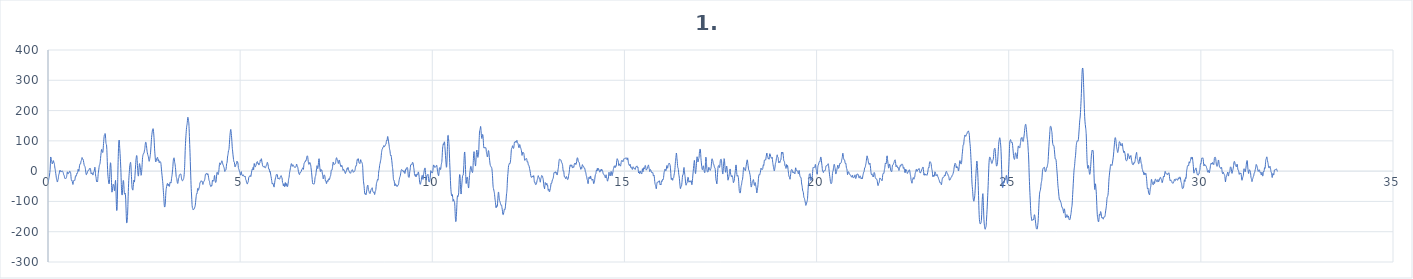
| Category | 1. kanál |
|---|---|
| 0.0 | -30.1 |
| 0.0078125 | -34.2 |
| 0.015625 | -29.4 |
| 0.0234375 | -22.9 |
| 0.03125 | -19.9 |
| 0.0390625 | -12.9 |
| 0.046875 | -4.4 |
| 0.0546875 | 4.5 |
| 0.0625 | 26 |
| 0.0703125 | 46.8 |
| 0.078125 | 43.8 |
| 0.0859375 | 34.8 |
| 0.09375 | 35.4 |
| 0.1015625 | 30.7 |
| 0.109375 | 24 |
| 0.1171875 | 25.7 |
| 0.125 | 28.2 |
| 0.1328125 | 31.4 |
| 0.140625 | 34.7 |
| 0.1484375 | 31 |
| 0.15625 | 27.1 |
| 0.1640625 | 25.2 |
| 0.171875 | 17.9 |
| 0.1796875 | 10.5 |
| 0.1875 | 5.8 |
| 0.1953125 | -1.5 |
| 0.203125 | -8.7 |
| 0.2109375 | -15.7 |
| 0.21875 | -23.9 |
| 0.2265625 | -28.2 |
| 0.234375 | -31.4 |
| 0.2421875 | -35.9 |
| 0.25 | -34 |
| 0.2578125 | -29.1 |
| 0.265625 | -25.5 |
| 0.2734375 | -17.5 |
| 0.28125 | -11.3 |
| 0.2890625 | -9.8 |
| 0.296875 | -3.2 |
| 0.3046875 | 2.1 |
| 0.3125 | -0.7 |
| 0.3203125 | -0.9 |
| 0.328125 | 2 |
| 0.3359375 | 0 |
| 0.34375 | -2.1 |
| 0.3515625 | -1.1 |
| 0.359375 | -0.9 |
| 0.3671875 | 0 |
| 0.375 | 0.8 |
| 0.3828125 | -1.6 |
| 0.390625 | -3.5 |
| 0.3984375 | -5.6 |
| 0.40625 | -11 |
| 0.4140625 | -13.5 |
| 0.421875 | -14.4 |
| 0.4296875 | -20 |
| 0.4375 | -23.9 |
| 0.4453125 | -23.2 |
| 0.453125 | -23.8 |
| 0.4609375 | -24.8 |
| 0.46875 | -23.8 |
| 0.4765625 | -21.7 |
| 0.484375 | -18 |
| 0.4921875 | -11.2 |
| 0.5 | -3.8 |
| 0.5078125 | -2.5 |
| 0.515625 | -7.4 |
| 0.5234375 | -9.6 |
| 0.53125 | -6.9 |
| 0.5390625 | -5.1 |
| 0.546875 | -5.8 |
| 0.5546875 | -4.1 |
| 0.5625 | -0.3 |
| 0.5703125 | -0.2 |
| 0.578125 | -2.8 |
| 0.5859375 | -4.4 |
| 0.59375 | -10.8 |
| 0.6015625 | -23.3 |
| 0.609375 | -30.4 |
| 0.6171875 | -29.8 |
| 0.625 | -30.4 |
| 0.6328125 | -34.8 |
| 0.640625 | -40.5 |
| 0.6484375 | -44.1 |
| 0.65625 | -41 |
| 0.6640625 | -34.5 |
| 0.671875 | -30.8 |
| 0.6796875 | -29.3 |
| 0.6875 | -29.5 |
| 0.6953125 | -30.6 |
| 0.703125 | -26.8 |
| 0.7109375 | -19.2 |
| 0.71875 | -15.2 |
| 0.7265625 | -15.6 |
| 0.734375 | -16.6 |
| 0.7421875 | -13.4 |
| 0.75 | -7.4 |
| 0.7578125 | -6 |
| 0.765625 | -7 |
| 0.7734375 | -1.7 |
| 0.78125 | 5.6 |
| 0.7890625 | 5.5 |
| 0.796875 | 0.3 |
| 0.8046875 | 0.4 |
| 0.8125 | 8.8 |
| 0.8203125 | 17.8 |
| 0.828125 | 22.7 |
| 0.8359375 | 24 |
| 0.84375 | 23.2 |
| 0.8515625 | 26.4 |
| 0.859375 | 32.9 |
| 0.8671875 | 35 |
| 0.875 | 37.9 |
| 0.8828125 | 44.4 |
| 0.890625 | 44.3 |
| 0.8984375 | 39.8 |
| 0.90625 | 39.5 |
| 0.9140625 | 39.3 |
| 0.921875 | 34.8 |
| 0.9296875 | 28.6 |
| 0.9375 | 22.7 |
| 0.9453125 | 18.4 |
| 0.953125 | 16.5 |
| 0.9609375 | 15.5 |
| 0.96875 | 11.3 |
| 0.9765625 | 4.5 |
| 0.984375 | -3.1 |
| 0.9921875 | -10.6 |
| 1.0 | -11.7 |
| 1.0078125 | -7.8 |
| 1.015625 | -7.6 |
| 1.0234375 | -6.7 |
| 1.03125 | -1.2 |
| 1.0390625 | 1.5 |
| 1.046875 | 2.1 |
| 1.0546875 | 3.6 |
| 1.0625 | 2.7 |
| 1.0703125 | 3.5 |
| 1.078125 | 8.4 |
| 1.0859375 | 10.1 |
| 1.09375 | 8.7 |
| 1.1015625 | 8.7 |
| 1.109375 | 4.6 |
| 1.1171875 | -4.8 |
| 1.125 | -9.4 |
| 1.1328125 | -7.3 |
| 1.140625 | -5.5 |
| 1.1484375 | -5.7 |
| 1.15625 | -8 |
| 1.1640625 | -12.3 |
| 1.171875 | -12.5 |
| 1.1796875 | -6.9 |
| 1.1875 | -2.9 |
| 1.1953125 | -2.1 |
| 1.203125 | 0.7 |
| 1.2109375 | 7.2 |
| 1.21875 | 13.1 |
| 1.2265625 | 8.6 |
| 1.234375 | -6.9 |
| 1.2421875 | -16.7 |
| 1.25 | -20 |
| 1.2578125 | -28.8 |
| 1.265625 | -34.5 |
| 1.2734375 | -32.4 |
| 1.28125 | -34.3 |
| 1.2890625 | -34.9 |
| 1.296875 | -24.6 |
| 1.3046875 | -11.8 |
| 1.3125 | -3.2 |
| 1.3203125 | 4.2 |
| 1.328125 | 12.3 |
| 1.3359375 | 18.7 |
| 1.34375 | 21.5 |
| 1.3515625 | 24.2 |
| 1.359375 | 31.3 |
| 1.3671875 | 42.1 |
| 1.375 | 52.1 |
| 1.3828125 | 61.2 |
| 1.390625 | 69.9 |
| 1.3984375 | 71.6 |
| 1.40625 | 66.8 |
| 1.4140625 | 63.8 |
| 1.421875 | 61.3 |
| 1.4296875 | 63.6 |
| 1.4375 | 76.8 |
| 1.4453125 | 91.3 |
| 1.453125 | 103.2 |
| 1.4609375 | 114.8 |
| 1.46875 | 119.4 |
| 1.4765625 | 120.2 |
| 1.484375 | 124.2 |
| 1.4921875 | 122.2 |
| 1.5 | 108 |
| 1.5078125 | 93.4 |
| 1.515625 | 89.2 |
| 1.5234375 | 86.7 |
| 1.53125 | 71.6 |
| 1.5390625 | 45.5 |
| 1.546875 | 17.4 |
| 1.5546875 | -5.3 |
| 1.5625 | -18.6 |
| 1.5703125 | -27.5 |
| 1.578125 | -36.2 |
| 1.5859375 | -42 |
| 1.59375 | -41.4 |
| 1.6015625 | -28.6 |
| 1.609375 | -4.7 |
| 1.6171875 | 17.2 |
| 1.625 | 27.8 |
| 1.6328125 | 25.4 |
| 1.640625 | 9.3 |
| 1.6484375 | -20.3 |
| 1.65625 | -53.1 |
| 1.6640625 | -69.4 |
| 1.671875 | -66.4 |
| 1.6796875 | -58.5 |
| 1.6875 | -50.1 |
| 1.6953125 | -43.6 |
| 1.703125 | -44.2 |
| 1.7109375 | -46.4 |
| 1.71875 | -51.6 |
| 1.7265625 | -63.2 |
| 1.734375 | -64.7 |
| 1.7421875 | -51.4 |
| 1.75 | -36.9 |
| 1.7578125 | -30.4 |
| 1.765625 | -46.6 |
| 1.7734375 | -85 |
| 1.78125 | -116.8 |
| 1.7890625 | -130.1 |
| 1.796875 | -125.4 |
| 1.8046875 | -93 |
| 1.8125 | -42.2 |
| 1.8203125 | 6.5 |
| 1.828125 | 48.1 |
| 1.8359375 | 78.9 |
| 1.84375 | 96.9 |
| 1.8515625 | 102.5 |
| 1.859375 | 92.3 |
| 1.8671875 | 74.4 |
| 1.875 | 58.3 |
| 1.8828125 | 40.7 |
| 1.890625 | 20.3 |
| 1.8984375 | -4.7 |
| 1.90625 | -36.6 |
| 1.9140625 | -63 |
| 1.921875 | -75.9 |
| 1.9296875 | -79 |
| 1.9375 | -69.1 |
| 1.9453125 | -49.1 |
| 1.953125 | -34.6 |
| 1.9609375 | -30.5 |
| 1.96875 | -35.8 |
| 1.9765625 | -51.9 |
| 1.984375 | -69 |
| 1.9921875 | -75.9 |
| 2.0 | -74.7 |
| 2.0078125 | -72.4 |
| 2.015625 | -76.7 |
| 2.0234375 | -94.9 |
| 2.03125 | -124.9 |
| 2.0390625 | -154.7 |
| 2.046875 | -170.6 |
| 2.0546875 | -170.4 |
| 2.0625 | -162.5 |
| 2.0703125 | -146.3 |
| 2.078125 | -116.8 |
| 2.0859375 | -82.8 |
| 2.09375 | -54.2 |
| 2.1015625 | -31 |
| 2.109375 | -14.6 |
| 2.1171875 | -1.3 |
| 2.125 | 13.3 |
| 2.1328125 | 22.1 |
| 2.140625 | 25.9 |
| 2.1484375 | 29.2 |
| 2.15625 | 21.7 |
| 2.1640625 | 2.8 |
| 2.171875 | -17.4 |
| 2.1796875 | -39.2 |
| 2.1875 | -55.5 |
| 2.1953125 | -59.7 |
| 2.203125 | -61.9 |
| 2.2109375 | -61.9 |
| 2.21875 | -51.2 |
| 2.2265625 | -36.6 |
| 2.234375 | -29.6 |
| 2.2421875 | -33 |
| 2.25 | -36.2 |
| 2.2578125 | -26.6 |
| 2.265625 | -9.5 |
| 2.2734375 | 5.5 |
| 2.28125 | 21.3 |
| 2.2890625 | 36.3 |
| 2.296875 | 45.3 |
| 2.3046875 | 51.3 |
| 2.3125 | 51 |
| 2.3203125 | 38.3 |
| 2.328125 | 19.1 |
| 2.3359375 | 1.5 |
| 2.34375 | -11.9 |
| 2.3515625 | -16.4 |
| 2.359375 | -10.3 |
| 2.3671875 | 3.9 |
| 2.375 | 19.3 |
| 2.3828125 | 25.1 |
| 2.390625 | 20.1 |
| 2.3984375 | 13.4 |
| 2.40625 | 6.7 |
| 2.4140625 | -3.8 |
| 2.421875 | -13.8 |
| 2.4296875 | -12.4 |
| 2.4375 | -0.5 |
| 2.4453125 | 13.1 |
| 2.453125 | 29.2 |
| 2.4609375 | 44.8 |
| 2.46875 | 51.6 |
| 2.4765625 | 55 |
| 2.484375 | 58.4 |
| 2.4921875 | 58.3 |
| 2.5 | 60.6 |
| 2.5078125 | 66.9 |
| 2.515625 | 71.6 |
| 2.5234375 | 78.7 |
| 2.53125 | 88.9 |
| 2.5390625 | 94.9 |
| 2.546875 | 95.5 |
| 2.5546875 | 92.1 |
| 2.5625 | 84.3 |
| 2.5703125 | 74.3 |
| 2.578125 | 65.8 |
| 2.5859375 | 60 |
| 2.59375 | 55.3 |
| 2.6015625 | 51.9 |
| 2.609375 | 48.9 |
| 2.6171875 | 42.9 |
| 2.625 | 35.3 |
| 2.6328125 | 32.4 |
| 2.640625 | 35.6 |
| 2.6484375 | 41.5 |
| 2.65625 | 47.5 |
| 2.6640625 | 55.1 |
| 2.671875 | 66.5 |
| 2.6796875 | 80.6 |
| 2.6875 | 96.6 |
| 2.6953125 | 111.1 |
| 2.703125 | 120.8 |
| 2.7109375 | 128.8 |
| 2.71875 | 135.5 |
| 2.7265625 | 138.9 |
| 2.734375 | 140.2 |
| 2.7421875 | 136.2 |
| 2.75 | 125.5 |
| 2.7578125 | 111.8 |
| 2.765625 | 93.6 |
| 2.7734375 | 73.6 |
| 2.78125 | 59.3 |
| 2.7890625 | 46.4 |
| 2.796875 | 34 |
| 2.8046875 | 30.4 |
| 2.8125 | 32.8 |
| 2.8203125 | 35.7 |
| 2.828125 | 39.9 |
| 2.8359375 | 42.9 |
| 2.84375 | 44.8 |
| 2.8515625 | 45.5 |
| 2.859375 | 39 |
| 2.8671875 | 33.8 |
| 2.875 | 37.7 |
| 2.8828125 | 36.6 |
| 2.890625 | 28.8 |
| 2.8984375 | 28.1 |
| 2.90625 | 31.6 |
| 2.9140625 | 31.9 |
| 2.921875 | 31.3 |
| 2.9296875 | 30.1 |
| 2.9375 | 26 |
| 2.9453125 | 16.5 |
| 2.953125 | 3.9 |
| 2.9609375 | -6 |
| 2.96875 | -15.2 |
| 2.9765625 | -25.4 |
| 2.984375 | -34.4 |
| 2.9921875 | -46.7 |
| 3.0 | -62.9 |
| 3.0078125 | -76.3 |
| 3.015625 | -90.8 |
| 3.0234375 | -108.3 |
| 3.03125 | -117.8 |
| 3.0390625 | -117.9 |
| 3.046875 | -114.5 |
| 3.0546875 | -101.6 |
| 3.0625 | -80.2 |
| 3.0703125 | -65.1 |
| 3.078125 | -57.5 |
| 3.0859375 | -50.7 |
| 3.09375 | -46.3 |
| 3.1015625 | -42.6 |
| 3.109375 | -40.3 |
| 3.1171875 | -44.5 |
| 3.125 | -48.6 |
| 3.1328125 | -45.8 |
| 3.140625 | -42.4 |
| 3.1484375 | -45.5 |
| 3.15625 | -50.5 |
| 3.1640625 | -47.5 |
| 3.171875 | -39.3 |
| 3.1796875 | -35.9 |
| 3.1875 | -36.8 |
| 3.1953125 | -39.2 |
| 3.203125 | -38.4 |
| 3.2109375 | -29.1 |
| 3.21875 | -20.1 |
| 3.2265625 | -15 |
| 3.234375 | -5.8 |
| 3.2421875 | 4.4 |
| 3.25 | 15.7 |
| 3.2578125 | 30.9 |
| 3.265625 | 39.6 |
| 3.2734375 | 42.5 |
| 3.28125 | 43.8 |
| 3.2890625 | 37 |
| 3.296875 | 28.8 |
| 3.3046875 | 24.2 |
| 3.3125 | 16.4 |
| 3.3203125 | 6.4 |
| 3.328125 | -6.1 |
| 3.3359375 | -18.2 |
| 3.34375 | -21.3 |
| 3.3515625 | -24.4 |
| 3.359375 | -33.2 |
| 3.3671875 | -38.6 |
| 3.375 | -40.8 |
| 3.3828125 | -38.1 |
| 3.390625 | -28.9 |
| 3.3984375 | -23.8 |
| 3.40625 | -21.4 |
| 3.4140625 | -15.5 |
| 3.421875 | -12.7 |
| 3.4296875 | -12.2 |
| 3.4375 | -9.7 |
| 3.4453125 | -9 |
| 3.453125 | -9.5 |
| 3.4609375 | -11.4 |
| 3.46875 | -17.9 |
| 3.4765625 | -25.3 |
| 3.484375 | -29.6 |
| 3.4921875 | -31.3 |
| 3.5 | -31.9 |
| 3.5078125 | -31.2 |
| 3.515625 | -28.6 |
| 3.5234375 | -26.1 |
| 3.53125 | -23.6 |
| 3.5390625 | -16.7 |
| 3.546875 | -5.3 |
| 3.5546875 | 11.5 |
| 3.5625 | 38.3 |
| 3.5703125 | 68.3 |
| 3.578125 | 92.1 |
| 3.5859375 | 109.6 |
| 3.59375 | 124 |
| 3.6015625 | 137.7 |
| 3.609375 | 148.3 |
| 3.6171875 | 153.3 |
| 3.625 | 161.2 |
| 3.6328125 | 173.8 |
| 3.640625 | 178.1 |
| 3.6484375 | 172.5 |
| 3.65625 | 166.8 |
| 3.6640625 | 159.6 |
| 3.671875 | 141.4 |
| 3.6796875 | 114.2 |
| 3.6875 | 88.1 |
| 3.6953125 | 62.3 |
| 3.703125 | 31.5 |
| 3.7109375 | -0.4 |
| 3.71875 | -30.7 |
| 3.7265625 | -56.7 |
| 3.734375 | -75.4 |
| 3.7421875 | -94.4 |
| 3.75 | -113.3 |
| 3.7578125 | -120.6 |
| 3.765625 | -122.2 |
| 3.7734375 | -126.6 |
| 3.78125 | -128.4 |
| 3.7890625 | -126.7 |
| 3.796875 | -125.6 |
| 3.8046875 | -124.4 |
| 3.8125 | -122 |
| 3.8203125 | -118.8 |
| 3.828125 | -115.5 |
| 3.8359375 | -108.7 |
| 3.84375 | -98.1 |
| 3.8515625 | -88.6 |
| 3.859375 | -80 |
| 3.8671875 | -74.6 |
| 3.875 | -75.2 |
| 3.8828125 | -70.6 |
| 3.890625 | -59.9 |
| 3.8984375 | -57.1 |
| 3.90625 | -61.5 |
| 3.9140625 | -63.3 |
| 3.921875 | -60.5 |
| 3.9296875 | -55.9 |
| 3.9375 | -52.7 |
| 3.9453125 | -47.6 |
| 3.953125 | -39.7 |
| 3.9609375 | -36.7 |
| 3.96875 | -36.7 |
| 3.9765625 | -33.5 |
| 3.984375 | -31.9 |
| 3.9921875 | -33.3 |
| 4.0 | -33 |
| 4.0078125 | -32.6 |
| 4.015625 | -35.2 |
| 4.0234375 | -40.8 |
| 4.03125 | -44.1 |
| 4.0390625 | -40.4 |
| 4.046875 | -35.3 |
| 4.0546875 | -34.5 |
| 4.0625 | -33.7 |
| 4.0703125 | -30.7 |
| 4.078125 | -27.7 |
| 4.0859375 | -21.5 |
| 4.09375 | -13.1 |
| 4.1015625 | -9.5 |
| 4.109375 | -9.8 |
| 4.1171875 | -9 |
| 4.125 | -7.4 |
| 4.1328125 | -8.2 |
| 4.140625 | -11.6 |
| 4.1484375 | -12 |
| 4.15625 | -8.5 |
| 4.1640625 | -9.3 |
| 4.171875 | -15.3 |
| 4.1796875 | -21.8 |
| 4.1875 | -28.3 |
| 4.1953125 | -31.9 |
| 4.203125 | -34.1 |
| 4.2109375 | -41.3 |
| 4.21875 | -46.6 |
| 4.2265625 | -46.9 |
| 4.234375 | -50.2 |
| 4.2421875 | -50.9 |
| 4.25 | -46.8 |
| 4.2578125 | -48.1 |
| 4.265625 | -47.4 |
| 4.2734375 | -36.6 |
| 4.28125 | -29.7 |
| 4.2890625 | -31.4 |
| 4.296875 | -32.2 |
| 4.3046875 | -32.2 |
| 4.3125 | -32.2 |
| 4.3203125 | -26.8 |
| 4.328125 | -17.3 |
| 4.3359375 | -14.1 |
| 4.34375 | -22.3 |
| 4.3515625 | -32.9 |
| 4.359375 | -37.1 |
| 4.3671875 | -37 |
| 4.375 | -33.2 |
| 4.3828125 | -22.9 |
| 4.390625 | -10.5 |
| 4.3984375 | -4 |
| 4.40625 | -4.3 |
| 4.4140625 | -7.7 |
| 4.421875 | -10.9 |
| 4.4296875 | -11.1 |
| 4.4375 | -7.5 |
| 4.4453125 | 0.1 |
| 4.453125 | 11.3 |
| 4.4609375 | 21.8 |
| 4.46875 | 27.4 |
| 4.4765625 | 25.9 |
| 4.484375 | 21.6 |
| 4.4921875 | 22.6 |
| 4.5 | 26 |
| 4.5078125 | 27 |
| 4.515625 | 30.5 |
| 4.5234375 | 34.2 |
| 4.53125 | 32.8 |
| 4.5390625 | 28.9 |
| 4.546875 | 24.3 |
| 4.5546875 | 21 |
| 4.5625 | 19 |
| 4.5703125 | 15.3 |
| 4.578125 | 12.7 |
| 4.5859375 | 9.4 |
| 4.59375 | 2.1 |
| 4.6015625 | -1.2 |
| 4.609375 | 1.8 |
| 4.6171875 | 4.1 |
| 4.625 | 3.8 |
| 4.6328125 | 5.6 |
| 4.640625 | 15 |
| 4.6484375 | 24.4 |
| 4.65625 | 26.6 |
| 4.6640625 | 33.9 |
| 4.671875 | 46.6 |
| 4.6796875 | 52.3 |
| 4.6875 | 58 |
| 4.6953125 | 66.5 |
| 4.703125 | 69.2 |
| 4.7109375 | 74 |
| 4.71875 | 88 |
| 4.7265625 | 103.7 |
| 4.734375 | 116.8 |
| 4.7421875 | 127.3 |
| 4.75 | 135.4 |
| 4.7578125 | 137.6 |
| 4.765625 | 129.7 |
| 4.7734375 | 117.9 |
| 4.78125 | 106 |
| 4.7890625 | 89.8 |
| 4.796875 | 75.4 |
| 4.8046875 | 66.2 |
| 4.8125 | 56 |
| 4.8203125 | 46.6 |
| 4.828125 | 38.4 |
| 4.8359375 | 31.5 |
| 4.84375 | 31.1 |
| 4.8515625 | 27.9 |
| 4.859375 | 17.6 |
| 4.8671875 | 13.8 |
| 4.875 | 15.3 |
| 4.8828125 | 17 |
| 4.890625 | 22.7 |
| 4.8984375 | 24.3 |
| 4.90625 | 24.6 |
| 4.9140625 | 31.8 |
| 4.921875 | 32.8 |
| 4.9296875 | 28.5 |
| 4.9375 | 29.2 |
| 4.9453125 | 23.5 |
| 4.953125 | 12.2 |
| 4.9609375 | 7.9 |
| 4.96875 | 5.5 |
| 4.9765625 | 2 |
| 4.984375 | -0.7 |
| 4.9921875 | -4.4 |
| 5.0 | -8.3 |
| 5.0078125 | -12.6 |
| 5.015625 | -12.7 |
| 5.0234375 | -4.5 |
| 5.03125 | -1.7 |
| 5.0390625 | -8.7 |
| 5.046875 | -12.3 |
| 5.0546875 | -12.5 |
| 5.0625 | -14.9 |
| 5.0703125 | -14.9 |
| 5.078125 | -12.3 |
| 5.0859375 | -12.5 |
| 5.09375 | -15.4 |
| 5.1015625 | -16.9 |
| 5.109375 | -18 |
| 5.1171875 | -19.4 |
| 5.125 | -17.2 |
| 5.1328125 | -17.3 |
| 5.140625 | -24.5 |
| 5.1484375 | -28.6 |
| 5.15625 | -30.3 |
| 5.1640625 | -36 |
| 5.171875 | -39.1 |
| 5.1796875 | -40.9 |
| 5.1875 | -42.7 |
| 5.1953125 | -39.3 |
| 5.203125 | -36.8 |
| 5.2109375 | -34.7 |
| 5.21875 | -25.9 |
| 5.2265625 | -19.7 |
| 5.234375 | -18.8 |
| 5.2421875 | -16.6 |
| 5.25 | -16.2 |
| 5.2578125 | -15.8 |
| 5.265625 | -14.6 |
| 5.2734375 | -17.7 |
| 5.28125 | -17.1 |
| 5.2890625 | -9.1 |
| 5.296875 | -3.4 |
| 5.3046875 | 1.5 |
| 5.3125 | 6.2 |
| 5.3203125 | 4.4 |
| 5.328125 | 6.2 |
| 5.3359375 | 12.4 |
| 5.34375 | 7.5 |
| 5.3515625 | 4.7 |
| 5.359375 | 18 |
| 5.3671875 | 25.2 |
| 5.375 | 19.4 |
| 5.3828125 | 15.6 |
| 5.390625 | 14.4 |
| 5.3984375 | 14.8 |
| 5.40625 | 17.5 |
| 5.4140625 | 20.1 |
| 5.421875 | 24.9 |
| 5.4296875 | 28.6 |
| 5.4375 | 28.6 |
| 5.4453125 | 31.3 |
| 5.453125 | 30.8 |
| 5.4609375 | 24.7 |
| 5.46875 | 24.2 |
| 5.4765625 | 25.5 |
| 5.484375 | 20.8 |
| 5.4921875 | 20.5 |
| 5.5 | 25.5 |
| 5.5078125 | 25.9 |
| 5.515625 | 28.4 |
| 5.5234375 | 36.1 |
| 5.53125 | 36.4 |
| 5.5390625 | 34.4 |
| 5.546875 | 39.6 |
| 5.5546875 | 40.8 |
| 5.5625 | 34.1 |
| 5.5703125 | 28.4 |
| 5.578125 | 22.7 |
| 5.5859375 | 17.3 |
| 5.59375 | 16.4 |
| 5.6015625 | 15.2 |
| 5.609375 | 13.3 |
| 5.6171875 | 14.9 |
| 5.625 | 16.4 |
| 5.6328125 | 14 |
| 5.640625 | 11.8 |
| 5.6484375 | 11.6 |
| 5.65625 | 11 |
| 5.6640625 | 12.1 |
| 5.671875 | 16.2 |
| 5.6796875 | 19 |
| 5.6875 | 19.6 |
| 5.6953125 | 22.6 |
| 5.703125 | 27.8 |
| 5.7109375 | 29.1 |
| 5.71875 | 25.2 |
| 5.7265625 | 20.9 |
| 5.734375 | 14.9 |
| 5.7421875 | 7.6 |
| 5.75 | 6.8 |
| 5.7578125 | 6.8 |
| 5.765625 | -0.8 |
| 5.7734375 | -3.7 |
| 5.78125 | -0.8 |
| 5.7890625 | -5.6 |
| 5.796875 | -13.7 |
| 5.8046875 | -18.4 |
| 5.8125 | -23.8 |
| 5.8203125 | -30.6 |
| 5.828125 | -38.1 |
| 5.8359375 | -42.6 |
| 5.84375 | -40.7 |
| 5.8515625 | -39.7 |
| 5.859375 | -42.6 |
| 5.8671875 | -45.8 |
| 5.875 | -50 |
| 5.8828125 | -52.7 |
| 5.890625 | -47.7 |
| 5.8984375 | -38.7 |
| 5.90625 | -31.6 |
| 5.9140625 | -25.8 |
| 5.921875 | -21.7 |
| 5.9296875 | -18.2 |
| 5.9375 | -13.1 |
| 5.9453125 | -10.7 |
| 5.953125 | -11.9 |
| 5.9609375 | -11 |
| 5.96875 | -12.3 |
| 5.9765625 | -20.2 |
| 5.984375 | -25.2 |
| 5.9921875 | -23.1 |
| 6.0 | -22.8 |
| 6.0078125 | -25.9 |
| 6.015625 | -26.6 |
| 6.0234375 | -26.2 |
| 6.03125 | -25.8 |
| 6.0390625 | -21.6 |
| 6.046875 | -18.3 |
| 6.0546875 | -18.3 |
| 6.0625 | -15.1 |
| 6.0703125 | -15.3 |
| 6.078125 | -20 |
| 6.0859375 | -20.5 |
| 6.09375 | -26 |
| 6.1015625 | -36.7 |
| 6.109375 | -39 |
| 6.1171875 | -42.4 |
| 6.125 | -49.1 |
| 6.1328125 | -46.2 |
| 6.140625 | -41.9 |
| 6.1484375 | -46.6 |
| 6.15625 | -51.6 |
| 6.1640625 | -47.7 |
| 6.171875 | -38.7 |
| 6.1796875 | -38.4 |
| 6.1875 | -46.4 |
| 6.1953125 | -49.6 |
| 6.203125 | -45.5 |
| 6.2109375 | -41.1 |
| 6.21875 | -43.8 |
| 6.2265625 | -50.7 |
| 6.234375 | -50.7 |
| 6.2421875 | -45.7 |
| 6.25 | -39.9 |
| 6.2578125 | -30.4 |
| 6.265625 | -23.9 |
| 6.2734375 | -20 |
| 6.28125 | -11 |
| 6.2890625 | -3.3 |
| 6.296875 | 1.3 |
| 6.3046875 | 7.5 |
| 6.3125 | 12.3 |
| 6.3203125 | 17.5 |
| 6.328125 | 23.7 |
| 6.3359375 | 24.7 |
| 6.34375 | 21.2 |
| 6.3515625 | 17.1 |
| 6.359375 | 16 |
| 6.3671875 | 19.8 |
| 6.375 | 21.4 |
| 6.3828125 | 19.1 |
| 6.390625 | 18.3 |
| 6.3984375 | 16.5 |
| 6.40625 | 13.1 |
| 6.4140625 | 12.9 |
| 6.421875 | 13.4 |
| 6.4296875 | 12.3 |
| 6.4375 | 12.9 |
| 6.4453125 | 13.5 |
| 6.453125 | 13.9 |
| 6.4609375 | 19.1 |
| 6.46875 | 23.5 |
| 6.4765625 | 20.4 |
| 6.484375 | 16.7 |
| 6.4921875 | 15.8 |
| 6.5 | 12.4 |
| 6.5078125 | 6.4 |
| 6.515625 | -0.5 |
| 6.5234375 | -6.5 |
| 6.53125 | -8.7 |
| 6.5390625 | -10.7 |
| 6.546875 | -11.1 |
| 6.5546875 | -5.9 |
| 6.5625 | -3.4 |
| 6.5703125 | -4.9 |
| 6.578125 | -3.3 |
| 6.5859375 | -1.4 |
| 6.59375 | 0.3 |
| 6.6015625 | 4.3 |
| 6.609375 | 6.2 |
| 6.6171875 | 7.3 |
| 6.625 | 10.7 |
| 6.6328125 | 10.7 |
| 6.640625 | 6 |
| 6.6484375 | 7 |
| 6.65625 | 17.5 |
| 6.6640625 | 25.5 |
| 6.671875 | 26.3 |
| 6.6796875 | 29 |
| 6.6875 | 31.3 |
| 6.6953125 | 30.3 |
| 6.703125 | 33.8 |
| 6.7109375 | 36.8 |
| 6.71875 | 35.7 |
| 6.7265625 | 40.8 |
| 6.734375 | 47.5 |
| 6.7421875 | 49.2 |
| 6.75 | 50.7 |
| 6.7578125 | 48.1 |
| 6.765625 | 39.4 |
| 6.7734375 | 30.9 |
| 6.78125 | 24.8 |
| 6.7890625 | 22.1 |
| 6.796875 | 23.6 |
| 6.8046875 | 27.2 |
| 6.8125 | 28.9 |
| 6.8203125 | 26.6 |
| 6.828125 | 23.8 |
| 6.8359375 | 19.8 |
| 6.84375 | 11.9 |
| 6.8515625 | 3.5 |
| 6.859375 | -5.2 |
| 6.8671875 | -16.1 |
| 6.875 | -27.2 |
| 6.8828125 | -37.5 |
| 6.890625 | -42.1 |
| 6.8984375 | -40.9 |
| 6.90625 | -41.9 |
| 6.9140625 | -43.4 |
| 6.921875 | -42 |
| 6.9296875 | -41.5 |
| 6.9375 | -37.2 |
| 6.9453125 | -26.3 |
| 6.953125 | -18.6 |
| 6.9609375 | -16.8 |
| 6.96875 | -12.4 |
| 6.9765625 | -4.2 |
| 6.984375 | 3.7 |
| 6.9921875 | 12.2 |
| 7.0 | 18 |
| 7.0078125 | 14.9 |
| 7.015625 | 8.7 |
| 7.0234375 | 9.4 |
| 7.03125 | 17.3 |
| 7.0390625 | 28.8 |
| 7.046875 | 39.4 |
| 7.0546875 | 41 |
| 7.0625 | 30.2 |
| 7.0703125 | 16.7 |
| 7.078125 | 6.6 |
| 7.0859375 | -1 |
| 7.09375 | -0.5 |
| 7.1015625 | 5.6 |
| 7.109375 | 4.9 |
| 7.1171875 | 2.8 |
| 7.125 | 3.5 |
| 7.1328125 | -2.1 |
| 7.140625 | -9.6 |
| 7.1484375 | -14.3 |
| 7.15625 | -21.5 |
| 7.1640625 | -25.7 |
| 7.171875 | -20.8 |
| 7.1796875 | -13.9 |
| 7.1875 | -12.3 |
| 7.1953125 | -13.9 |
| 7.203125 | -15.4 |
| 7.2109375 | -22.4 |
| 7.21875 | -32 |
| 7.2265625 | -32.2 |
| 7.234375 | -32.4 |
| 7.2421875 | -39.8 |
| 7.25 | -41 |
| 7.2578125 | -35.6 |
| 7.265625 | -32.1 |
| 7.2734375 | -31.2 |
| 7.28125 | -33.9 |
| 7.2890625 | -33.5 |
| 7.296875 | -26.9 |
| 7.3046875 | -25.2 |
| 7.3125 | -28.4 |
| 7.3203125 | -28.7 |
| 7.328125 | -26.1 |
| 7.3359375 | -21.7 |
| 7.34375 | -17.8 |
| 7.3515625 | -16.2 |
| 7.359375 | -10.8 |
| 7.3671875 | -1.3 |
| 7.375 | 3.8 |
| 7.3828125 | 3.3 |
| 7.390625 | 3.9 |
| 7.3984375 | 8.2 |
| 7.40625 | 15.6 |
| 7.4140625 | 25 |
| 7.421875 | 30.2 |
| 7.4296875 | 26.7 |
| 7.4375 | 22.4 |
| 7.4453125 | 23.1 |
| 7.453125 | 23.2 |
| 7.4609375 | 22.6 |
| 7.46875 | 24.2 |
| 7.4765625 | 25 |
| 7.484375 | 28.3 |
| 7.4921875 | 36.1 |
| 7.5 | 42.1 |
| 7.5078125 | 44.5 |
| 7.515625 | 42.8 |
| 7.5234375 | 37.8 |
| 7.53125 | 37 |
| 7.5390625 | 36.5 |
| 7.546875 | 29.8 |
| 7.5546875 | 25.3 |
| 7.5625 | 27.4 |
| 7.5703125 | 32.1 |
| 7.578125 | 36.3 |
| 7.5859375 | 34.9 |
| 7.59375 | 28.5 |
| 7.6015625 | 23.4 |
| 7.609375 | 20.2 |
| 7.6171875 | 17.1 |
| 7.625 | 14.2 |
| 7.6328125 | 15 |
| 7.640625 | 18.9 |
| 7.6484375 | 18.8 |
| 7.65625 | 15.8 |
| 7.6640625 | 12.1 |
| 7.671875 | 5 |
| 7.6796875 | 2.2 |
| 7.6875 | 5.9 |
| 7.6953125 | 5.2 |
| 7.703125 | 2.5 |
| 7.7109375 | 2.5 |
| 7.71875 | -0.3 |
| 7.7265625 | -4.6 |
| 7.734375 | -7.3 |
| 7.7421875 | -7.6 |
| 7.75 | -3.1 |
| 7.7578125 | 0.1 |
| 7.765625 | -0.2 |
| 7.7734375 | 4.6 |
| 7.78125 | 9 |
| 7.7890625 | 6.3 |
| 7.796875 | 7.2 |
| 7.8046875 | 12.2 |
| 7.8125 | 10.7 |
| 7.8203125 | 5 |
| 7.828125 | 2 |
| 7.8359375 | 0 |
| 7.84375 | -3.3 |
| 7.8515625 | -5.4 |
| 7.859375 | -4.9 |
| 7.8671875 | -5.6 |
| 7.875 | -6.9 |
| 7.8828125 | -3.9 |
| 7.890625 | -0.1 |
| 7.8984375 | 0.4 |
| 7.90625 | 1.9 |
| 7.9140625 | 4.5 |
| 7.921875 | 4.7 |
| 7.9296875 | 2.3 |
| 7.9375 | -1.9 |
| 7.9453125 | -3.7 |
| 7.953125 | -2.3 |
| 7.9609375 | -2 |
| 7.96875 | -1.6 |
| 7.9765625 | 0.6 |
| 7.984375 | 1.9 |
| 7.9921875 | 5.5 |
| 8.0 | 12.8 |
| 8.0078125 | 17.6 |
| 8.015625 | 17.6 |
| 8.0234375 | 17.2 |
| 8.03125 | 22 |
| 8.0390625 | 32.3 |
| 8.046875 | 38.1 |
| 8.0546875 | 36.2 |
| 8.0625 | 36.8 |
| 8.0703125 | 41.2 |
| 8.078125 | 39.7 |
| 8.0859375 | 32.8 |
| 8.09375 | 27.5 |
| 8.1015625 | 26.4 |
| 8.109375 | 26.3 |
| 8.1171875 | 25.1 |
| 8.125 | 28.7 |
| 8.1328125 | 36.8 |
| 8.140625 | 37.5 |
| 8.1484375 | 32.2 |
| 8.15625 | 31.2 |
| 8.1640625 | 30.3 |
| 8.171875 | 26.8 |
| 8.1796875 | 24.5 |
| 8.1875 | 16.6 |
| 8.1953125 | -2.5 |
| 8.203125 | -23 |
| 8.2109375 | -35.3 |
| 8.21875 | -42.7 |
| 8.2265625 | -51.8 |
| 8.234375 | -63.5 |
| 8.2421875 | -73.4 |
| 8.25 | -76.1 |
| 8.2578125 | -73.8 |
| 8.265625 | -75.8 |
| 8.2734375 | -78.4 |
| 8.28125 | -74.9 |
| 8.2890625 | -68.6 |
| 8.296875 | -60.6 |
| 8.3046875 | -52.7 |
| 8.3125 | -48.6 |
| 8.3203125 | -45.9 |
| 8.328125 | -49.6 |
| 8.3359375 | -60.2 |
| 8.34375 | -64.3 |
| 8.3515625 | -64.9 |
| 8.359375 | -70.1 |
| 8.3671875 | -72.8 |
| 8.375 | -73.3 |
| 8.3828125 | -73.8 |
| 8.390625 | -69.8 |
| 8.3984375 | -64.8 |
| 8.40625 | -61.5 |
| 8.4140625 | -59 |
| 8.421875 | -59 |
| 8.4296875 | -56.8 |
| 8.4375 | -54.9 |
| 8.4453125 | -61.3 |
| 8.453125 | -67.3 |
| 8.4609375 | -67.7 |
| 8.46875 | -69.7 |
| 8.4765625 | -70.8 |
| 8.484375 | -69.5 |
| 8.4921875 | -73.4 |
| 8.5 | -77.3 |
| 8.5078125 | -72.2 |
| 8.515625 | -66 |
| 8.5234375 | -64.7 |
| 8.53125 | -60.4 |
| 8.5390625 | -50 |
| 8.546875 | -41.1 |
| 8.5546875 | -37.1 |
| 8.5625 | -34.1 |
| 8.5703125 | -29.1 |
| 8.578125 | -27.1 |
| 8.5859375 | -29.9 |
| 8.59375 | -24.6 |
| 8.6015625 | -8.3 |
| 8.609375 | 1.6 |
| 8.6171875 | 4.8 |
| 8.625 | 13.7 |
| 8.6328125 | 22 |
| 8.640625 | 25.4 |
| 8.6484375 | 30.7 |
| 8.65625 | 35.8 |
| 8.6640625 | 41.1 |
| 8.671875 | 51.6 |
| 8.6796875 | 61.8 |
| 8.6875 | 68.2 |
| 8.6953125 | 72 |
| 8.703125 | 73.8 |
| 8.7109375 | 77.2 |
| 8.71875 | 79.6 |
| 8.7265625 | 79.5 |
| 8.734375 | 83 |
| 8.7421875 | 84.4 |
| 8.75 | 80.7 |
| 8.7578125 | 81 |
| 8.765625 | 82.8 |
| 8.7734375 | 83.7 |
| 8.78125 | 87.3 |
| 8.7890625 | 88.3 |
| 8.796875 | 89.8 |
| 8.8046875 | 97.8 |
| 8.8125 | 101.6 |
| 8.8203125 | 100.3 |
| 8.828125 | 105.8 |
| 8.8359375 | 113.6 |
| 8.84375 | 113.7 |
| 8.8515625 | 107 |
| 8.859375 | 99 |
| 8.8671875 | 93 |
| 8.875 | 86.5 |
| 8.8828125 | 77.8 |
| 8.890625 | 71.7 |
| 8.8984375 | 67.7 |
| 8.90625 | 59 |
| 8.9140625 | 51.8 |
| 8.921875 | 53 |
| 8.9296875 | 52 |
| 8.9375 | 43.9 |
| 8.9453125 | 35.9 |
| 8.953125 | 26.7 |
| 8.9609375 | 15.9 |
| 8.96875 | 8.6 |
| 8.9765625 | -2 |
| 8.984375 | -18.8 |
| 8.9921875 | -29.1 |
| 9.0 | -29.4 |
| 9.0078125 | -31.4 |
| 9.015625 | -40.2 |
| 9.0234375 | -48.2 |
| 9.03125 | -46.9 |
| 9.0390625 | -41.7 |
| 9.046875 | -43 |
| 9.0546875 | -46.9 |
| 9.0625 | -45.9 |
| 9.0703125 | -46.2 |
| 9.078125 | -50.5 |
| 9.0859375 | -50.7 |
| 9.09375 | -47.7 |
| 9.1015625 | -46.8 |
| 9.109375 | -46.8 |
| 9.1171875 | -45.8 |
| 9.125 | -40.6 |
| 9.1328125 | -33 |
| 9.140625 | -28 |
| 9.1484375 | -23.1 |
| 9.15625 | -18.8 |
| 9.1640625 | -17.3 |
| 9.171875 | -12.7 |
| 9.1796875 | -5.2 |
| 9.1875 | 0.2 |
| 9.1953125 | 4.3 |
| 9.203125 | 5.3 |
| 9.2109375 | 3.9 |
| 9.21875 | 2.9 |
| 9.2265625 | 1.6 |
| 9.234375 | 2 |
| 9.2421875 | 0.9 |
| 9.25 | -3.3 |
| 9.2578125 | -1.8 |
| 9.265625 | 1.4 |
| 9.2734375 | -2.4 |
| 9.28125 | -6.8 |
| 9.2890625 | -7.7 |
| 9.296875 | -4.2 |
| 9.3046875 | 4.1 |
| 9.3125 | 7.6 |
| 9.3203125 | 5.6 |
| 9.328125 | 7.8 |
| 9.3359375 | 11.7 |
| 9.34375 | 11.9 |
| 9.3515625 | 11.8 |
| 9.359375 | 9.2 |
| 9.3671875 | -2.5 |
| 9.375 | -15.8 |
| 9.3828125 | -19.7 |
| 9.390625 | -20.1 |
| 9.3984375 | -20.3 |
| 9.40625 | -12.2 |
| 9.4140625 | -1.9 |
| 9.421875 | 3.7 |
| 9.4296875 | 12.1 |
| 9.4375 | 20.4 |
| 9.4453125 | 21.4 |
| 9.453125 | 22 |
| 9.4609375 | 22.8 |
| 9.46875 | 21.4 |
| 9.4765625 | 24.7 |
| 9.484375 | 29.1 |
| 9.4921875 | 28.5 |
| 9.5 | 26.7 |
| 9.5078125 | 20.6 |
| 9.515625 | 12.3 |
| 9.5234375 | 6.7 |
| 9.53125 | -3 |
| 9.5390625 | -12 |
| 9.546875 | -12.7 |
| 9.5546875 | -15.8 |
| 9.5625 | -17.5 |
| 9.5703125 | -11 |
| 9.578125 | -11.7 |
| 9.5859375 | -17.8 |
| 9.59375 | -14.6 |
| 9.6015625 | -9.5 |
| 9.609375 | -10 |
| 9.6171875 | -11.3 |
| 9.625 | -9.4 |
| 9.6328125 | -3.9 |
| 9.640625 | -2.8 |
| 9.6484375 | -9.1 |
| 9.65625 | -16.5 |
| 9.6640625 | -26.7 |
| 9.671875 | -37.5 |
| 9.6796875 | -42 |
| 9.6875 | -43.6 |
| 9.6953125 | -41.6 |
| 9.703125 | -36 |
| 9.7109375 | -32.8 |
| 9.71875 | -27 |
| 9.7265625 | -18.1 |
| 9.734375 | -14 |
| 9.7421875 | -15 |
| 9.75 | -21.9 |
| 9.7578125 | -27.3 |
| 9.765625 | -20 |
| 9.7734375 | -10.6 |
| 9.78125 | -5.8 |
| 9.7890625 | 1.1 |
| 9.796875 | 6.5 |
| 9.8046875 | 9.6 |
| 9.8125 | 10.1 |
| 9.8203125 | 1.8 |
| 9.828125 | -11 |
| 9.8359375 | -23 |
| 9.84375 | -29.7 |
| 9.8515625 | -23.7 |
| 9.859375 | -14.9 |
| 9.8671875 | -13.7 |
| 9.875 | -13.3 |
| 9.8828125 | -10.9 |
| 9.890625 | -11.1 |
| 9.8984375 | -17.9 |
| 9.90625 | -29.2 |
| 9.9140625 | -35.5 |
| 9.921875 | -35.2 |
| 9.9296875 | -33 |
| 9.9375 | -28.9 |
| 9.9453125 | -21.9 |
| 9.953125 | -9.5 |
| 9.9609375 | 1.6 |
| 9.96875 | 0.1 |
| 9.9765625 | -4 |
| 9.984375 | -2.5 |
| 9.9921875 | -4.3 |
| 10.0 | -6.4 |
| 10.0078125 | -4 |
| 10.015625 | 1.6 |
| 10.0234375 | 12.6 |
| 10.03125 | 20.1 |
| 10.0390625 | 19.3 |
| 10.046875 | 18.8 |
| 10.0546875 | 16.9 |
| 10.0625 | 12.7 |
| 10.0703125 | 13 |
| 10.078125 | 14.2 |
| 10.0859375 | 13.3 |
| 10.09375 | 14 |
| 10.1015625 | 16.3 |
| 10.109375 | 19.4 |
| 10.1171875 | 18.7 |
| 10.125 | 12.3 |
| 10.1328125 | 3.7 |
| 10.140625 | -4.6 |
| 10.1484375 | -9.4 |
| 10.15625 | -12.2 |
| 10.1640625 | -15.4 |
| 10.171875 | -9.4 |
| 10.1796875 | 4.1 |
| 10.1875 | 10.7 |
| 10.1953125 | 11.3 |
| 10.203125 | 9.5 |
| 10.2109375 | 5.3 |
| 10.21875 | 6.4 |
| 10.2265625 | 14.3 |
| 10.234375 | 21.8 |
| 10.2421875 | 26.5 |
| 10.25 | 33.4 |
| 10.2578125 | 50.4 |
| 10.265625 | 70.3 |
| 10.2734375 | 80.6 |
| 10.28125 | 87 |
| 10.2890625 | 90.7 |
| 10.296875 | 87.2 |
| 10.3046875 | 88.6 |
| 10.3125 | 96.5 |
| 10.3203125 | 94.5 |
| 10.328125 | 81.4 |
| 10.3359375 | 66.6 |
| 10.34375 | 51.8 |
| 10.3515625 | 37.3 |
| 10.359375 | 23 |
| 10.3671875 | 12.7 |
| 10.375 | 15.1 |
| 10.3828125 | 33.6 |
| 10.390625 | 64.1 |
| 10.3984375 | 97 |
| 10.40625 | 117.6 |
| 10.4140625 | 118.2 |
| 10.421875 | 107.8 |
| 10.4296875 | 97.4 |
| 10.4375 | 82.5 |
| 10.4453125 | 56.8 |
| 10.453125 | 29.1 |
| 10.4609375 | 5.5 |
| 10.46875 | -18.8 |
| 10.4765625 | -42.3 |
| 10.484375 | -59.9 |
| 10.4921875 | -71.8 |
| 10.5 | -79 |
| 10.5078125 | -81.8 |
| 10.515625 | -79.2 |
| 10.5234375 | -77.3 |
| 10.53125 | -87.5 |
| 10.5390625 | -99.5 |
| 10.546875 | -97.5 |
| 10.5546875 | -93.2 |
| 10.5625 | -97.2 |
| 10.5703125 | -100.1 |
| 10.578125 | -101.2 |
| 10.5859375 | -112.1 |
| 10.59375 | -134.1 |
| 10.6015625 | -155.5 |
| 10.609375 | -166.7 |
| 10.6171875 | -165.6 |
| 10.625 | -152.8 |
| 10.6328125 | -132.7 |
| 10.640625 | -109.6 |
| 10.6484375 | -88.5 |
| 10.65625 | -81 |
| 10.6640625 | -84.2 |
| 10.671875 | -83.6 |
| 10.6796875 | -80.3 |
| 10.6875 | -71.5 |
| 10.6953125 | -48.3 |
| 10.703125 | -23.9 |
| 10.7109375 | -11.6 |
| 10.71875 | -11.5 |
| 10.7265625 | -25.5 |
| 10.734375 | -49.7 |
| 10.7421875 | -70.5 |
| 10.75 | -75.6 |
| 10.7578125 | -64.3 |
| 10.765625 | -49.1 |
| 10.7734375 | -36.1 |
| 10.78125 | -23.5 |
| 10.7890625 | -15.5 |
| 10.796875 | -13.9 |
| 10.8046875 | -12.6 |
| 10.8125 | -3.1 |
| 10.8203125 | 18 |
| 10.828125 | 42.4 |
| 10.8359375 | 59.4 |
| 10.84375 | 63.3 |
| 10.8515625 | 50.8 |
| 10.859375 | 26.8 |
| 10.8671875 | -2.7 |
| 10.875 | -30.6 |
| 10.8828125 | -40.9 |
| 10.890625 | -31.8 |
| 10.8984375 | -22.4 |
| 10.90625 | -19.8 |
| 10.9140625 | -20.5 |
| 10.921875 | -27.2 |
| 10.9296875 | -39.8 |
| 10.9375 | -51.6 |
| 10.9453125 | -55.8 |
| 10.953125 | -47.8 |
| 10.9609375 | -30.4 |
| 10.96875 | -15 |
| 10.9765625 | -6.4 |
| 10.984375 | 1.7 |
| 10.9921875 | 10.7 |
| 11.0 | 15.3 |
| 11.0078125 | 15.8 |
| 11.015625 | 12.3 |
| 11.0234375 | 4.1 |
| 11.03125 | -1.2 |
| 11.0390625 | -2.6 |
| 11.046875 | -4.7 |
| 11.0546875 | 0.9 |
| 11.0625 | 19.6 |
| 11.0703125 | 41.3 |
| 11.078125 | 57.7 |
| 11.0859375 | 64.4 |
| 11.09375 | 57.5 |
| 11.1015625 | 44.4 |
| 11.109375 | 32.8 |
| 11.1171875 | 22.2 |
| 11.125 | 16.8 |
| 11.1328125 | 25 |
| 11.140625 | 44.4 |
| 11.1484375 | 61.4 |
| 11.15625 | 68.9 |
| 11.1640625 | 68.7 |
| 11.171875 | 60.1 |
| 11.1796875 | 48 |
| 11.1875 | 45.3 |
| 11.1953125 | 49.2 |
| 11.203125 | 54 |
| 11.2109375 | 70.6 |
| 11.21875 | 99 |
| 11.2265625 | 122.8 |
| 11.234375 | 134 |
| 11.2421875 | 137.1 |
| 11.25 | 142 |
| 11.2578125 | 147.6 |
| 11.265625 | 141.2 |
| 11.2734375 | 125.5 |
| 11.28125 | 112.6 |
| 11.2890625 | 107.6 |
| 11.296875 | 112.6 |
| 11.3046875 | 120 |
| 11.3125 | 121 |
| 11.3203125 | 115.4 |
| 11.328125 | 100.2 |
| 11.3359375 | 82.2 |
| 11.34375 | 76.6 |
| 11.3515625 | 77.1 |
| 11.359375 | 76.2 |
| 11.3671875 | 78.3 |
| 11.375 | 78.6 |
| 11.3828125 | 75.8 |
| 11.390625 | 77.1 |
| 11.3984375 | 74.7 |
| 11.40625 | 64.8 |
| 11.4140625 | 58.3 |
| 11.421875 | 54.3 |
| 11.4296875 | 48.2 |
| 11.4375 | 47.4 |
| 11.4453125 | 54.3 |
| 11.453125 | 62.5 |
| 11.4609375 | 67.7 |
| 11.46875 | 66 |
| 11.4765625 | 56.8 |
| 11.484375 | 45.7 |
| 11.4921875 | 36 |
| 11.5 | 27 |
| 11.5078125 | 20.3 |
| 11.515625 | 17.9 |
| 11.5234375 | 15.6 |
| 11.53125 | 12.7 |
| 11.5390625 | 12.8 |
| 11.546875 | 11.3 |
| 11.5546875 | 3.7 |
| 11.5625 | -7.1 |
| 11.5703125 | -23.1 |
| 11.578125 | -42.8 |
| 11.5859375 | -54.2 |
| 11.59375 | -57.9 |
| 11.6015625 | -62.7 |
| 11.609375 | -67.7 |
| 11.6171875 | -73.1 |
| 11.625 | -82.7 |
| 11.6328125 | -92.5 |
| 11.640625 | -99.3 |
| 11.6484375 | -108.7 |
| 11.65625 | -119.4 |
| 11.6640625 | -120.7 |
| 11.671875 | -114.9 |
| 11.6796875 | -114.3 |
| 11.6875 | -116.7 |
| 11.6953125 | -111.8 |
| 11.703125 | -98.3 |
| 11.7109375 | -81.2 |
| 11.71875 | -69.5 |
| 11.7265625 | -69.4 |
| 11.734375 | -79.5 |
| 11.7421875 | -91.7 |
| 11.75 | -96.9 |
| 11.7578125 | -98.6 |
| 11.765625 | -102.9 |
| 11.7734375 | -106.4 |
| 11.78125 | -109.8 |
| 11.7890625 | -112.6 |
| 11.796875 | -111.4 |
| 11.8046875 | -113.4 |
| 11.8125 | -120.1 |
| 11.8203125 | -126 |
| 11.828125 | -134 |
| 11.8359375 | -141.9 |
| 11.84375 | -143.8 |
| 11.8515625 | -141.6 |
| 11.859375 | -137.2 |
| 11.8671875 | -131.3 |
| 11.875 | -126.2 |
| 11.8828125 | -124.7 |
| 11.890625 | -126.6 |
| 11.8984375 | -122.9 |
| 11.90625 | -112.2 |
| 11.9140625 | -102.6 |
| 11.921875 | -91.8 |
| 11.9296875 | -78.7 |
| 11.9375 | -70.1 |
| 11.9453125 | -58 |
| 11.953125 | -35.9 |
| 11.9609375 | -18 |
| 11.96875 | -7.7 |
| 11.9765625 | 5.8 |
| 11.984375 | 17 |
| 11.9921875 | 20 |
| 12.0 | 23.1 |
| 12.0078125 | 26 |
| 12.015625 | 24.6 |
| 12.0234375 | 25.3 |
| 12.03125 | 30.3 |
| 12.0390625 | 38.1 |
| 12.046875 | 51.6 |
| 12.0546875 | 66.6 |
| 12.0625 | 74.7 |
| 12.0703125 | 75.8 |
| 12.078125 | 78 |
| 12.0859375 | 83.5 |
| 12.09375 | 83.2 |
| 12.1015625 | 77.2 |
| 12.109375 | 75 |
| 12.1171875 | 75.9 |
| 12.125 | 80.6 |
| 12.1328125 | 91 |
| 12.140625 | 96 |
| 12.1484375 | 94.7 |
| 12.15625 | 97 |
| 12.1640625 | 99.4 |
| 12.171875 | 97.4 |
| 12.1796875 | 95 |
| 12.1875 | 95.3 |
| 12.1953125 | 99.7 |
| 12.203125 | 101.8 |
| 12.2109375 | 97.5 |
| 12.21875 | 94.3 |
| 12.2265625 | 93.1 |
| 12.234375 | 89 |
| 12.2421875 | 84 |
| 12.25 | 79.4 |
| 12.2578125 | 77.1 |
| 12.265625 | 81.8 |
| 12.2734375 | 87.6 |
| 12.28125 | 86.3 |
| 12.2890625 | 81.4 |
| 12.296875 | 78.2 |
| 12.3046875 | 75 |
| 12.3125 | 71.5 |
| 12.3203125 | 67.1 |
| 12.328125 | 58.1 |
| 12.3359375 | 51.9 |
| 12.34375 | 56.6 |
| 12.3515625 | 62.3 |
| 12.359375 | 61.6 |
| 12.3671875 | 60.9 |
| 12.375 | 60.9 |
| 12.3828125 | 58.2 |
| 12.390625 | 51 |
| 12.3984375 | 40.9 |
| 12.40625 | 35.5 |
| 12.4140625 | 37.6 |
| 12.421875 | 40 |
| 12.4296875 | 39.8 |
| 12.4375 | 39.7 |
| 12.4453125 | 40.9 |
| 12.453125 | 41.8 |
| 12.4609375 | 38 |
| 12.46875 | 31.2 |
| 12.4765625 | 29.7 |
| 12.484375 | 30.9 |
| 12.4921875 | 26 |
| 12.5 | 19.9 |
| 12.5078125 | 19.5 |
| 12.515625 | 18.5 |
| 12.5234375 | 13.8 |
| 12.53125 | 8.8 |
| 12.5390625 | 4.2 |
| 12.546875 | -1.3 |
| 12.5546875 | -7.9 |
| 12.5625 | -14.4 |
| 12.5703125 | -18.8 |
| 12.578125 | -20.7 |
| 12.5859375 | -20.4 |
| 12.59375 | -17.8 |
| 12.6015625 | -15.9 |
| 12.609375 | -17 |
| 12.6171875 | -19.5 |
| 12.625 | -19.4 |
| 12.6328125 | -15.8 |
| 12.640625 | -15.3 |
| 12.6484375 | -24.7 |
| 12.65625 | -35.6 |
| 12.6640625 | -36.4 |
| 12.671875 | -36.2 |
| 12.6796875 | -42 |
| 12.6875 | -44.5 |
| 12.6953125 | -43.4 |
| 12.703125 | -43.6 |
| 12.7109375 | -41.5 |
| 12.71875 | -36.6 |
| 12.7265625 | -31.1 |
| 12.734375 | -27.5 |
| 12.7421875 | -25.2 |
| 12.75 | -18.7 |
| 12.7578125 | -14.9 |
| 12.765625 | -18.6 |
| 12.7734375 | -19.7 |
| 12.78125 | -20.6 |
| 12.7890625 | -24.8 |
| 12.796875 | -27.7 |
| 12.8046875 | -33.8 |
| 12.8125 | -36.3 |
| 12.8203125 | -28 |
| 12.828125 | -23.3 |
| 12.8359375 | -20.6 |
| 12.84375 | -14.8 |
| 12.8515625 | -15 |
| 12.859375 | -16 |
| 12.8671875 | -16.4 |
| 12.875 | -21.7 |
| 12.8828125 | -24.7 |
| 12.890625 | -32.5 |
| 12.8984375 | -47.3 |
| 12.90625 | -51.8 |
| 12.9140625 | -54.3 |
| 12.921875 | -58.7 |
| 12.9296875 | -49.1 |
| 12.9375 | -38.3 |
| 12.9453125 | -38.5 |
| 12.953125 | -40.8 |
| 12.9609375 | -45 |
| 12.96875 | -45.9 |
| 12.9765625 | -40.6 |
| 12.984375 | -41.1 |
| 12.9921875 | -44.8 |
| 13.0 | -45.8 |
| 13.0078125 | -53.4 |
| 13.015625 | -62.9 |
| 13.0234375 | -62.1 |
| 13.03125 | -59.2 |
| 13.0390625 | -63.6 |
| 13.046875 | -68.3 |
| 13.0546875 | -66.9 |
| 13.0625 | -62.3 |
| 13.0703125 | -58.3 |
| 13.078125 | -53.3 |
| 13.0859375 | -45.3 |
| 13.09375 | -39.5 |
| 13.1015625 | -40.2 |
| 13.109375 | -39.1 |
| 13.1171875 | -33 |
| 13.125 | -29.2 |
| 13.1328125 | -27.1 |
| 13.140625 | -24.8 |
| 13.1484375 | -22 |
| 13.15625 | -14.6 |
| 13.1640625 | -6.7 |
| 13.171875 | -4.3 |
| 13.1796875 | -5 |
| 13.1875 | -5.6 |
| 13.1953125 | -3.5 |
| 13.203125 | -2 |
| 13.2109375 | -5.6 |
| 13.21875 | -6.8 |
| 13.2265625 | -4.1 |
| 13.234375 | -6.7 |
| 13.2421875 | -11.9 |
| 13.25 | -12.6 |
| 13.2578125 | -8.7 |
| 13.265625 | -1.3 |
| 13.2734375 | 5.9 |
| 13.28125 | 11.4 |
| 13.2890625 | 20.6 |
| 13.296875 | 32.2 |
| 13.3046875 | 38.4 |
| 13.3125 | 39.3 |
| 13.3203125 | 39.3 |
| 13.328125 | 38.4 |
| 13.3359375 | 37.5 |
| 13.34375 | 37.5 |
| 13.3515625 | 35.1 |
| 13.359375 | 30.8 |
| 13.3671875 | 28.4 |
| 13.375 | 26.7 |
| 13.3828125 | 24 |
| 13.390625 | 19.4 |
| 13.3984375 | 9.7 |
| 13.40625 | 0.5 |
| 13.4140625 | 0.6 |
| 13.421875 | -0.7 |
| 13.4296875 | -11.5 |
| 13.4375 | -18.4 |
| 13.4453125 | -18.1 |
| 13.453125 | -19.9 |
| 13.4609375 | -22.7 |
| 13.46875 | -24.7 |
| 13.4765625 | -24.6 |
| 13.484375 | -20.1 |
| 13.4921875 | -17.7 |
| 13.5 | -19.9 |
| 13.5078125 | -23.4 |
| 13.515625 | -26.8 |
| 13.5234375 | -28.1 |
| 13.53125 | -26.8 |
| 13.5390625 | -22.6 |
| 13.546875 | -14.9 |
| 13.5546875 | -9.6 |
| 13.5625 | -4.9 |
| 13.5703125 | 5.1 |
| 13.578125 | 15 |
| 13.5859375 | 20.1 |
| 13.59375 | 20.7 |
| 13.6015625 | 17.3 |
| 13.609375 | 15.4 |
| 13.6171875 | 17.9 |
| 13.625 | 20.6 |
| 13.6328125 | 19.7 |
| 13.640625 | 14.5 |
| 13.6484375 | 10.3 |
| 13.65625 | 11.7 |
| 13.6640625 | 14.5 |
| 13.671875 | 14.4 |
| 13.6796875 | 12.6 |
| 13.6875 | 15.5 |
| 13.6953125 | 23.1 |
| 13.703125 | 25.4 |
| 13.7109375 | 24.1 |
| 13.71875 | 26.6 |
| 13.7265625 | 25.9 |
| 13.734375 | 21.9 |
| 13.7421875 | 22.5 |
| 13.75 | 26.2 |
| 13.7578125 | 32.3 |
| 13.765625 | 40.3 |
| 13.7734375 | 44 |
| 13.78125 | 43.8 |
| 13.7890625 | 40.1 |
| 13.796875 | 33.6 |
| 13.8046875 | 30.7 |
| 13.8125 | 30.7 |
| 13.8203125 | 29.4 |
| 13.828125 | 26.1 |
| 13.8359375 | 19.3 |
| 13.84375 | 14.6 |
| 13.8515625 | 12.7 |
| 13.859375 | 7.1 |
| 13.8671875 | 6.3 |
| 13.875 | 12.5 |
| 13.8828125 | 11 |
| 13.890625 | 9.1 |
| 13.8984375 | 17 |
| 13.90625 | 21.5 |
| 13.9140625 | 18.7 |
| 13.921875 | 17.5 |
| 13.9296875 | 16.8 |
| 13.9375 | 15.1 |
| 13.9453125 | 13 |
| 13.953125 | 9.5 |
| 13.9609375 | 9.1 |
| 13.96875 | 9.3 |
| 13.9765625 | 3.2 |
| 13.984375 | -2.1 |
| 13.9921875 | -3.5 |
| 14.0 | -8.9 |
| 14.0078125 | -14.7 |
| 14.015625 | -17.1 |
| 14.0234375 | -22.5 |
| 14.03125 | -27.9 |
| 14.0390625 | -31.1 |
| 14.046875 | -38.2 |
| 14.0546875 | -41.4 |
| 14.0625 | -32.2 |
| 14.0703125 | -22.2 |
| 14.078125 | -19.4 |
| 14.0859375 | -19.2 |
| 14.09375 | -21.5 |
| 14.1015625 | -25.8 |
| 14.109375 | -22.8 |
| 14.1171875 | -16 |
| 14.125 | -19.1 |
| 14.1328125 | -25.5 |
| 14.140625 | -25.5 |
| 14.1484375 | -27 |
| 14.15625 | -30.3 |
| 14.1640625 | -29.4 |
| 14.171875 | -27 |
| 14.1796875 | -26.2 |
| 14.1875 | -31.3 |
| 14.1953125 | -39.7 |
| 14.203125 | -41.4 |
| 14.2109375 | -38.8 |
| 14.21875 | -35.2 |
| 14.2265625 | -27.7 |
| 14.234375 | -19.3 |
| 14.2421875 | -12.8 |
| 14.25 | -10.1 |
| 14.2578125 | -8.2 |
| 14.265625 | -0.4 |
| 14.2734375 | 3.2 |
| 14.28125 | 0.9 |
| 14.2890625 | 6.3 |
| 14.296875 | 9.3 |
| 14.3046875 | 2.6 |
| 14.3125 | 3.1 |
| 14.3203125 | 8.8 |
| 14.328125 | 8 |
| 14.3359375 | 4.8 |
| 14.34375 | 2.3 |
| 14.3515625 | -0.8 |
| 14.359375 | -3.2 |
| 14.3671875 | -2.5 |
| 14.375 | 2.8 |
| 14.3828125 | 4.8 |
| 14.390625 | 1 |
| 14.3984375 | 2.1 |
| 14.40625 | 6.7 |
| 14.4140625 | 4.9 |
| 14.421875 | 1.8 |
| 14.4296875 | 1.9 |
| 14.4375 | -2.2 |
| 14.4453125 | -8.1 |
| 14.453125 | -8.7 |
| 14.4609375 | -9.7 |
| 14.46875 | -13.2 |
| 14.4765625 | -14.1 |
| 14.484375 | -14.5 |
| 14.4921875 | -17.5 |
| 14.5 | -21.5 |
| 14.5078125 | -21.5 |
| 14.515625 | -15 |
| 14.5234375 | -12.1 |
| 14.53125 | -18.1 |
| 14.5390625 | -22.4 |
| 14.546875 | -25 |
| 14.5546875 | -31.7 |
| 14.5625 | -33 |
| 14.5703125 | -28.5 |
| 14.578125 | -26.1 |
| 14.5859375 | -18.8 |
| 14.59375 | -6 |
| 14.6015625 | -4.2 |
| 14.609375 | -11.8 |
| 14.6171875 | -13.8 |
| 14.625 | -14 |
| 14.6328125 | -15.6 |
| 14.640625 | -10 |
| 14.6484375 | -2.1 |
| 14.65625 | -1.3 |
| 14.6640625 | -5.6 |
| 14.671875 | -12.2 |
| 14.6796875 | -15 |
| 14.6875 | -10.8 |
| 14.6953125 | -6.4 |
| 14.703125 | -1.4 |
| 14.7109375 | 5.7 |
| 14.71875 | 9.7 |
| 14.7265625 | 13 |
| 14.734375 | 17.2 |
| 14.7421875 | 17.3 |
| 14.75 | 13.6 |
| 14.7578125 | 11.3 |
| 14.765625 | 14.2 |
| 14.7734375 | 18 |
| 14.78125 | 16 |
| 14.7890625 | 18.2 |
| 14.796875 | 29.8 |
| 14.8046875 | 38.7 |
| 14.8125 | 41.2 |
| 14.8203125 | 39.4 |
| 14.828125 | 36 |
| 14.8359375 | 35.3 |
| 14.84375 | 29.1 |
| 14.8515625 | 18.5 |
| 14.859375 | 19.5 |
| 14.8671875 | 24 |
| 14.875 | 20.7 |
| 14.8828125 | 19.1 |
| 14.890625 | 18.3 |
| 14.8984375 | 16.7 |
| 14.90625 | 21.3 |
| 14.9140625 | 28.3 |
| 14.921875 | 33.2 |
| 14.9296875 | 35.3 |
| 14.9375 | 33.4 |
| 14.9453125 | 33.5 |
| 14.953125 | 33.7 |
| 14.9609375 | 31 |
| 14.96875 | 33.6 |
| 14.9765625 | 38.8 |
| 14.984375 | 40.5 |
| 14.9921875 | 41.7 |
| 15.0 | 41 |
| 15.0078125 | 39.7 |
| 15.015625 | 41.1 |
| 15.0234375 | 42.1 |
| 15.03125 | 43 |
| 15.0390625 | 43.6 |
| 15.046875 | 43.1 |
| 15.0546875 | 44 |
| 15.0625 | 41.4 |
| 15.0703125 | 37.4 |
| 15.078125 | 41.3 |
| 15.0859375 | 43.7 |
| 15.09375 | 36.7 |
| 15.1015625 | 29.4 |
| 15.109375 | 24.9 |
| 15.1171875 | 21.4 |
| 15.125 | 19.2 |
| 15.1328125 | 17.9 |
| 15.140625 | 20.7 |
| 15.1484375 | 22.7 |
| 15.15625 | 16.5 |
| 15.1640625 | 12.4 |
| 15.171875 | 14.5 |
| 15.1796875 | 12.4 |
| 15.1875 | 9.8 |
| 15.1953125 | 9.7 |
| 15.203125 | 5.9 |
| 15.2109375 | 6.2 |
| 15.21875 | 13 |
| 15.2265625 | 14.4 |
| 15.234375 | 11.6 |
| 15.2421875 | 9.9 |
| 15.25 | 8.5 |
| 15.2578125 | 9.7 |
| 15.265625 | 10 |
| 15.2734375 | 6.3 |
| 15.28125 | 5.7 |
| 15.2890625 | 9.3 |
| 15.296875 | 13.1 |
| 15.3046875 | 15.6 |
| 15.3125 | 15 |
| 15.3203125 | 15.8 |
| 15.328125 | 17.3 |
| 15.3359375 | 13.2 |
| 15.34375 | 11.9 |
| 15.3515625 | 13.1 |
| 15.359375 | 3.4 |
| 15.3671875 | -5.8 |
| 15.375 | -3 |
| 15.3828125 | -1.6 |
| 15.390625 | -6.6 |
| 15.3984375 | -8.4 |
| 15.40625 | -3.9 |
| 15.4140625 | 0.6 |
| 15.421875 | -1.9 |
| 15.4296875 | -6.5 |
| 15.4375 | -7.1 |
| 15.4453125 | -8.7 |
| 15.453125 | -8.2 |
| 15.4609375 | 0.9 |
| 15.46875 | 8.1 |
| 15.4765625 | 3.6 |
| 15.484375 | -1.9 |
| 15.4921875 | 3.1 |
| 15.5 | 11 |
| 15.5078125 | 10.3 |
| 15.515625 | 6.8 |
| 15.5234375 | 9.3 |
| 15.53125 | 14.9 |
| 15.5390625 | 18.5 |
| 15.546875 | 18.1 |
| 15.5546875 | 12.7 |
| 15.5625 | 5.4 |
| 15.5703125 | 3.4 |
| 15.578125 | 5.8 |
| 15.5859375 | 6 |
| 15.59375 | 8 |
| 15.6015625 | 13.8 |
| 15.609375 | 15.9 |
| 15.6171875 | 17.9 |
| 15.625 | 20.6 |
| 15.6328125 | 15.8 |
| 15.640625 | 9.9 |
| 15.6484375 | 5.9 |
| 15.65625 | -0.9 |
| 15.6640625 | -1 |
| 15.671875 | 5.2 |
| 15.6796875 | 5 |
| 15.6875 | 2.5 |
| 15.6953125 | 1.4 |
| 15.703125 | -2.3 |
| 15.7109375 | -5.2 |
| 15.71875 | -5.9 |
| 15.7265625 | -5.7 |
| 15.734375 | -4.3 |
| 15.7421875 | -6.7 |
| 15.75 | -13.5 |
| 15.7578125 | -16.3 |
| 15.765625 | -13.5 |
| 15.7734375 | -14.4 |
| 15.78125 | -23.3 |
| 15.7890625 | -34.1 |
| 15.796875 | -41.6 |
| 15.8046875 | -44.8 |
| 15.8125 | -46.7 |
| 15.8203125 | -53 |
| 15.828125 | -58.1 |
| 15.8359375 | -51.7 |
| 15.84375 | -41.7 |
| 15.8515625 | -37.6 |
| 15.859375 | -35.9 |
| 15.8671875 | -36 |
| 15.875 | -36.7 |
| 15.8828125 | -34.1 |
| 15.890625 | -33.2 |
| 15.8984375 | -34.6 |
| 15.90625 | -32.2 |
| 15.9140625 | -32.3 |
| 15.921875 | -40.5 |
| 15.9296875 | -45.4 |
| 15.9375 | -43 |
| 15.9453125 | -43.8 |
| 15.953125 | -44.8 |
| 15.9609375 | -37.1 |
| 15.96875 | -31.9 |
| 15.9765625 | -34.3 |
| 15.984375 | -32.2 |
| 15.9921875 | -27.1 |
| 16.0 | -27.4 |
| 16.0078125 | -28.2 |
| 16.015625 | -24.6 |
| 16.0234375 | -15.4 |
| 16.03125 | -5.4 |
| 16.0390625 | -1.1 |
| 16.046875 | 2.5 |
| 16.0546875 | 6.9 |
| 16.0625 | 5.8 |
| 16.0703125 | 2.3 |
| 16.078125 | 1 |
| 16.0859375 | 2.7 |
| 16.09375 | 10.3 |
| 16.1015625 | 18 |
| 16.109375 | 17.3 |
| 16.1171875 | 11.5 |
| 16.125 | 9.8 |
| 16.1328125 | 15.5 |
| 16.140625 | 21.2 |
| 16.1484375 | 22.4 |
| 16.15625 | 24.7 |
| 16.1640625 | 26.9 |
| 16.171875 | 25.2 |
| 16.1796875 | 22.9 |
| 16.1875 | 20 |
| 16.1953125 | 13.2 |
| 16.203125 | 0.3 |
| 16.2109375 | -16.4 |
| 16.21875 | -26.9 |
| 16.2265625 | -26.5 |
| 16.234375 | -22.5 |
| 16.2421875 | -23.8 |
| 16.25 | -29.5 |
| 16.2578125 | -29.7 |
| 16.265625 | -24.4 |
| 16.2734375 | -22.9 |
| 16.28125 | -21.3 |
| 16.2890625 | -15.1 |
| 16.296875 | -9 |
| 16.3046875 | -3.6 |
| 16.3125 | 5.1 |
| 16.3203125 | 18.8 |
| 16.328125 | 31.8 |
| 16.3359375 | 39.9 |
| 16.34375 | 50.6 |
| 16.3515625 | 59.7 |
| 16.359375 | 54.2 |
| 16.3671875 | 42.3 |
| 16.375 | 31.5 |
| 16.3828125 | 18.7 |
| 16.390625 | 11.4 |
| 16.3984375 | 9.4 |
| 16.40625 | 0.4 |
| 16.4140625 | -10.4 |
| 16.421875 | -15.8 |
| 16.4296875 | -23.9 |
| 16.4375 | -35.3 |
| 16.4453125 | -46 |
| 16.453125 | -55.9 |
| 16.4609375 | -57.5 |
| 16.46875 | -51.4 |
| 16.4765625 | -49.9 |
| 16.484375 | -49.7 |
| 16.4921875 | -43.1 |
| 16.5 | -32.9 |
| 16.5078125 | -20.7 |
| 16.515625 | -13.1 |
| 16.5234375 | -13.3 |
| 16.53125 | -8.7 |
| 16.5390625 | 2.9 |
| 16.546875 | 11.4 |
| 16.5546875 | 10.7 |
| 16.5625 | -0.3 |
| 16.5703125 | -11.1 |
| 16.578125 | -17.8 |
| 16.5859375 | -29.3 |
| 16.59375 | -41.1 |
| 16.6015625 | -46.1 |
| 16.609375 | -45.8 |
| 16.6171875 | -41.6 |
| 16.625 | -39.5 |
| 16.6328125 | -37.7 |
| 16.640625 | -28.9 |
| 16.6484375 | -21.4 |
| 16.65625 | -20.3 |
| 16.6640625 | -22.8 |
| 16.671875 | -31.5 |
| 16.6796875 | -36.5 |
| 16.6875 | -32.4 |
| 16.6953125 | -32.7 |
| 16.703125 | -35.7 |
| 16.7109375 | -34.6 |
| 16.71875 | -35.4 |
| 16.7265625 | -34.6 |
| 16.734375 | -31.3 |
| 16.7421875 | -35.8 |
| 16.75 | -43.6 |
| 16.7578125 | -44.5 |
| 16.765625 | -37.5 |
| 16.7734375 | -25.2 |
| 16.78125 | -12.8 |
| 16.7890625 | -2 |
| 16.796875 | 8.9 |
| 16.8046875 | 18.6 |
| 16.8125 | 28.7 |
| 16.8203125 | 35.5 |
| 16.828125 | 27.8 |
| 16.8359375 | 9.5 |
| 16.84375 | -5 |
| 16.8515625 | -8 |
| 16.859375 | 0.1 |
| 16.8671875 | 11.2 |
| 16.875 | 24.6 |
| 16.8828125 | 40.8 |
| 16.890625 | 47.5 |
| 16.8984375 | 42.6 |
| 16.90625 | 35.2 |
| 16.9140625 | 30.2 |
| 16.921875 | 33.7 |
| 16.9296875 | 40.5 |
| 16.9375 | 42.3 |
| 16.9453125 | 50.5 |
| 16.953125 | 64.4 |
| 16.9609375 | 70.6 |
| 16.96875 | 73.2 |
| 16.9765625 | 71.4 |
| 16.984375 | 57.4 |
| 16.9921875 | 40.8 |
| 17.0 | 29.8 |
| 17.0078125 | 20.1 |
| 17.015625 | 11.2 |
| 17.0234375 | 5.8 |
| 17.03125 | 4.7 |
| 17.0390625 | 8.8 |
| 17.046875 | 15.3 |
| 17.0546875 | 17.5 |
| 17.0625 | 12.5 |
| 17.0703125 | 4.6 |
| 17.078125 | -1.8 |
| 17.0859375 | -5 |
| 17.09375 | -4 |
| 17.1015625 | 6.2 |
| 17.109375 | 28.1 |
| 17.1171875 | 46.2 |
| 17.125 | 44.8 |
| 17.1328125 | 31.8 |
| 17.140625 | 17.1 |
| 17.1484375 | 3.9 |
| 17.15625 | -2 |
| 17.1640625 | -2.3 |
| 17.171875 | -3.2 |
| 17.1796875 | -0.7 |
| 17.1875 | 7.4 |
| 17.1953125 | 12.8 |
| 17.203125 | 10.6 |
| 17.2109375 | 7.5 |
| 17.21875 | 6.7 |
| 17.2265625 | 3.8 |
| 17.234375 | 2.5 |
| 17.2421875 | 5.8 |
| 17.25 | 8.8 |
| 17.2578125 | 14.4 |
| 17.265625 | 26.3 |
| 17.2734375 | 37.3 |
| 17.28125 | 40.9 |
| 17.2890625 | 38.3 |
| 17.296875 | 35.2 |
| 17.3046875 | 31.4 |
| 17.3125 | 24.6 |
| 17.3203125 | 22.1 |
| 17.328125 | 22 |
| 17.3359375 | 16.4 |
| 17.34375 | 12 |
| 17.3515625 | 11.7 |
| 17.359375 | 9 |
| 17.3671875 | 0.2 |
| 17.375 | -16.4 |
| 17.3828125 | -29.1 |
| 17.390625 | -32.4 |
| 17.3984375 | -39.2 |
| 17.40625 | -42.1 |
| 17.4140625 | -29.1 |
| 17.421875 | -11.7 |
| 17.4296875 | 3.3 |
| 17.4375 | 13.8 |
| 17.4453125 | 16.6 |
| 17.453125 | 18.4 |
| 17.4609375 | 18.5 |
| 17.46875 | 13.5 |
| 17.4765625 | 12.2 |
| 17.484375 | 19.2 |
| 17.4921875 | 30.6 |
| 17.5 | 38.2 |
| 17.5078125 | 38.2 |
| 17.515625 | 38.9 |
| 17.5234375 | 37.8 |
| 17.53125 | 26.5 |
| 17.5390625 | 12.7 |
| 17.546875 | 1.4 |
| 17.5546875 | -8 |
| 17.5625 | -8.7 |
| 17.5703125 | 1 |
| 17.578125 | 15.7 |
| 17.5859375 | 31.2 |
| 17.59375 | 41.3 |
| 17.6015625 | 39.7 |
| 17.609375 | 26.9 |
| 17.6171875 | 11.6 |
| 17.625 | 0.7 |
| 17.6328125 | -3.8 |
| 17.640625 | 0.1 |
| 17.6484375 | 9.9 |
| 17.65625 | 16.4 |
| 17.6640625 | 15.3 |
| 17.671875 | 7.1 |
| 17.6796875 | -8.1 |
| 17.6875 | -24 |
| 17.6953125 | -29.9 |
| 17.703125 | -26.6 |
| 17.7109375 | -22.7 |
| 17.71875 | -17.3 |
| 17.7265625 | -10.7 |
| 17.734375 | -5.3 |
| 17.7421875 | 2.9 |
| 17.75 | 7.2 |
| 17.7578125 | -1.1 |
| 17.765625 | -10.4 |
| 17.7734375 | -13.9 |
| 17.78125 | -17.9 |
| 17.7890625 | -18.1 |
| 17.796875 | -14.6 |
| 17.8046875 | -15.8 |
| 17.8125 | -18.9 |
| 17.8203125 | -22.8 |
| 17.828125 | -31.7 |
| 17.8359375 | -38.1 |
| 17.84375 | -36.2 |
| 17.8515625 | -33.5 |
| 17.859375 | -29.3 |
| 17.8671875 | -19.4 |
| 17.875 | -10 |
| 17.8828125 | -2.8 |
| 17.890625 | 8.1 |
| 17.8984375 | 19.1 |
| 17.90625 | 20.4 |
| 17.9140625 | 10.2 |
| 17.921875 | -5 |
| 17.9296875 | -15.6 |
| 17.9375 | -16.6 |
| 17.9453125 | -14.1 |
| 17.953125 | -14.5 |
| 17.9609375 | -18 |
| 17.96875 | -26.2 |
| 17.9765625 | -41.6 |
| 17.984375 | -57.6 |
| 17.9921875 | -67.4 |
| 18.0 | -71.3 |
| 18.0078125 | -72.3 |
| 18.015625 | -71.5 |
| 18.0234375 | -65 |
| 18.03125 | -53.8 |
| 18.0390625 | -48 |
| 18.046875 | -45.2 |
| 18.0546875 | -37.4 |
| 18.0625 | -31.4 |
| 18.0703125 | -29.1 |
| 18.078125 | -22.6 |
| 18.0859375 | -11.5 |
| 18.09375 | 1.8 |
| 18.1015625 | 11.8 |
| 18.109375 | 11.2 |
| 18.1171875 | 6.5 |
| 18.125 | 7.2 |
| 18.1328125 | 7.4 |
| 18.140625 | 2.8 |
| 18.1484375 | 1.6 |
| 18.15625 | 7.5 |
| 18.1640625 | 14.9 |
| 18.171875 | 21 |
| 18.1796875 | 27.1 |
| 18.1875 | 33.7 |
| 18.1953125 | 37.4 |
| 18.203125 | 33.6 |
| 18.2109375 | 25.6 |
| 18.21875 | 18.3 |
| 18.2265625 | 10 |
| 18.234375 | 3.6 |
| 18.2421875 | 2.6 |
| 18.25 | 0.4 |
| 18.2578125 | -5.4 |
| 18.265625 | -10.2 |
| 18.2734375 | -15.6 |
| 18.28125 | -26.4 |
| 18.2890625 | -41.3 |
| 18.296875 | -51.5 |
| 18.3046875 | -51.9 |
| 18.3125 | -47.5 |
| 18.3203125 | -41.5 |
| 18.328125 | -35.1 |
| 18.3359375 | -32.7 |
| 18.34375 | -31.5 |
| 18.3515625 | -28.1 |
| 18.359375 | -28.9 |
| 18.3671875 | -35.4 |
| 18.375 | -42.4 |
| 18.3828125 | -47 |
| 18.390625 | -45.1 |
| 18.3984375 | -38.8 |
| 18.40625 | -38.3 |
| 18.4140625 | -44.8 |
| 18.421875 | -50.7 |
| 18.4296875 | -55.5 |
| 18.4375 | -64.4 |
| 18.4453125 | -71.8 |
| 18.453125 | -67.3 |
| 18.4609375 | -58.2 |
| 18.46875 | -53.2 |
| 18.4765625 | -43.5 |
| 18.484375 | -29.1 |
| 18.4921875 | -19.1 |
| 18.5 | -12.8 |
| 18.5078125 | -11.3 |
| 18.515625 | -13.1 |
| 18.5234375 | -10.9 |
| 18.53125 | -7.1 |
| 18.5390625 | -2.9 |
| 18.546875 | 5.1 |
| 18.5546875 | 10 |
| 18.5625 | 8.4 |
| 18.5703125 | 5.8 |
| 18.578125 | 4.6 |
| 18.5859375 | 5.1 |
| 18.59375 | 6.4 |
| 18.6015625 | 9.8 |
| 18.609375 | 17.8 |
| 18.6171875 | 21.2 |
| 18.625 | 18.7 |
| 18.6328125 | 25.2 |
| 18.640625 | 35.4 |
| 18.6484375 | 35.7 |
| 18.65625 | 35.7 |
| 18.6640625 | 38.1 |
| 18.671875 | 36.4 |
| 18.6796875 | 39.4 |
| 18.6875 | 47.3 |
| 18.6953125 | 53.2 |
| 18.703125 | 59.3 |
| 18.7109375 | 58.7 |
| 18.71875 | 51.5 |
| 18.7265625 | 48.7 |
| 18.734375 | 45.1 |
| 18.7421875 | 41.1 |
| 18.75 | 43.4 |
| 18.7578125 | 41.7 |
| 18.765625 | 39.5 |
| 18.7734375 | 48.6 |
| 18.78125 | 57.1 |
| 18.7890625 | 56.9 |
| 18.796875 | 54.1 |
| 18.8046875 | 49 |
| 18.8125 | 44.9 |
| 18.8203125 | 44 |
| 18.828125 | 42.4 |
| 18.8359375 | 44 |
| 18.84375 | 45.9 |
| 18.8515625 | 38.7 |
| 18.859375 | 28.8 |
| 18.8671875 | 22 |
| 18.875 | 15.9 |
| 18.8828125 | 11.4 |
| 18.890625 | 5.8 |
| 18.8984375 | 0.9 |
| 18.90625 | 3.4 |
| 18.9140625 | 9.3 |
| 18.921875 | 17.1 |
| 18.9296875 | 25.7 |
| 18.9375 | 28.3 |
| 18.9453125 | 32.3 |
| 18.953125 | 40.2 |
| 18.9609375 | 44.6 |
| 18.96875 | 50.5 |
| 18.9765625 | 53.9 |
| 18.984375 | 48.2 |
| 18.9921875 | 46.3 |
| 19.0 | 44.9 |
| 19.0078125 | 33.5 |
| 19.015625 | 27.5 |
| 19.0234375 | 31.7 |
| 19.03125 | 32.3 |
| 19.0390625 | 29.1 |
| 19.046875 | 28.4 |
| 19.0546875 | 31.9 |
| 19.0625 | 35.8 |
| 19.0703125 | 37 |
| 19.078125 | 44.9 |
| 19.0859375 | 59.2 |
| 19.09375 | 63.1 |
| 19.1015625 | 58.4 |
| 19.109375 | 59.4 |
| 19.1171875 | 63 |
| 19.125 | 60.4 |
| 19.1328125 | 52.1 |
| 19.140625 | 41.7 |
| 19.1484375 | 34.3 |
| 19.15625 | 32.3 |
| 19.1640625 | 31.3 |
| 19.171875 | 24.5 |
| 19.1796875 | 16.7 |
| 19.1875 | 16.3 |
| 19.1953125 | 15.1 |
| 19.203125 | 8.9 |
| 19.2109375 | 13.3 |
| 19.21875 | 21.9 |
| 19.2265625 | 16.7 |
| 19.234375 | 13 |
| 19.2421875 | 18.8 |
| 19.25 | 15.6 |
| 19.2578125 | 5.3 |
| 19.265625 | -2.4 |
| 19.2734375 | -11.5 |
| 19.28125 | -17.7 |
| 19.2890625 | -17.7 |
| 19.296875 | -20.7 |
| 19.3046875 | -26.3 |
| 19.3125 | -25.5 |
| 19.3203125 | -17.4 |
| 19.328125 | -7.2 |
| 19.3359375 | 0.5 |
| 19.34375 | 4.3 |
| 19.3515625 | 5.4 |
| 19.359375 | 5.2 |
| 19.3671875 | 3.6 |
| 19.375 | -0.5 |
| 19.3828125 | -4.9 |
| 19.390625 | -4.6 |
| 19.3984375 | -2.3 |
| 19.40625 | -4.6 |
| 19.4140625 | -6.4 |
| 19.421875 | -5.4 |
| 19.4296875 | -7.9 |
| 19.4375 | -8.3 |
| 19.4453125 | 1.2 |
| 19.453125 | 10.4 |
| 19.4609375 | 9.8 |
| 19.46875 | 4.1 |
| 19.4765625 | 1.3 |
| 19.484375 | 2.1 |
| 19.4921875 | 1.9 |
| 19.5 | 1.1 |
| 19.5078125 | 0.4 |
| 19.515625 | -3.6 |
| 19.5234375 | -8.5 |
| 19.53125 | -7.7 |
| 19.5390625 | -1.2 |
| 19.546875 | 2.2 |
| 19.5546875 | -3.9 |
| 19.5625 | -13 |
| 19.5703125 | -17.3 |
| 19.578125 | -20 |
| 19.5859375 | -21.1 |
| 19.59375 | -20.9 |
| 19.6015625 | -27.2 |
| 19.609375 | -38.9 |
| 19.6171875 | -45.6 |
| 19.625 | -49.9 |
| 19.6328125 | -58.6 |
| 19.640625 | -65.6 |
| 19.6484375 | -67.1 |
| 19.65625 | -71.2 |
| 19.6640625 | -80.9 |
| 19.671875 | -87.4 |
| 19.6796875 | -88.4 |
| 19.6875 | -91.3 |
| 19.6953125 | -96.8 |
| 19.703125 | -100.9 |
| 19.7109375 | -106.8 |
| 19.71875 | -112.8 |
| 19.7265625 | -112 |
| 19.734375 | -108.1 |
| 19.7421875 | -105 |
| 19.75 | -101 |
| 19.7578125 | -97.4 |
| 19.765625 | -89.3 |
| 19.7734375 | -72.6 |
| 19.78125 | -55.7 |
| 19.7890625 | -42.8 |
| 19.796875 | -30 |
| 19.8046875 | -17.7 |
| 19.8125 | -10.1 |
| 19.8203125 | -9.4 |
| 19.828125 | -9 |
| 19.8359375 | -9 |
| 19.84375 | -19.7 |
| 19.8515625 | -31 |
| 19.859375 | -28.7 |
| 19.8671875 | -25 |
| 19.875 | -27.3 |
| 19.8828125 | -24.5 |
| 19.890625 | -14.3 |
| 19.8984375 | -1.3 |
| 19.90625 | 9.5 |
| 19.9140625 | 12.9 |
| 19.921875 | 11.9 |
| 19.9296875 | 12.8 |
| 19.9375 | 13.7 |
| 19.9453125 | 12.4 |
| 19.953125 | 12.6 |
| 19.9609375 | 17.4 |
| 19.96875 | 22.3 |
| 19.9765625 | 18.5 |
| 19.984375 | 8.8 |
| 19.9921875 | 4.5 |
| 20.0 | 2.1 |
| 20.0078125 | -6.3 |
| 20.015625 | -10.4 |
| 20.0234375 | -0.8 |
| 20.03125 | 12.1 |
| 20.0390625 | 18.2 |
| 20.046875 | 20.7 |
| 20.0546875 | 23.8 |
| 20.0625 | 27.8 |
| 20.0703125 | 31.2 |
| 20.078125 | 31.1 |
| 20.0859375 | 30.6 |
| 20.09375 | 35.7 |
| 20.1015625 | 43 |
| 20.109375 | 46.8 |
| 20.1171875 | 44.6 |
| 20.125 | 36.1 |
| 20.1328125 | 26.7 |
| 20.140625 | 18.8 |
| 20.1484375 | 8.7 |
| 20.15625 | 1.2 |
| 20.1640625 | -0.7 |
| 20.171875 | -3.4 |
| 20.1796875 | -4.5 |
| 20.1875 | -0.4 |
| 20.1953125 | 1.6 |
| 20.203125 | 0.5 |
| 20.2109375 | 1.9 |
| 20.21875 | 2.5 |
| 20.2265625 | 2.6 |
| 20.234375 | 8.5 |
| 20.2421875 | 15.7 |
| 20.25 | 18 |
| 20.2578125 | 18 |
| 20.265625 | 17.8 |
| 20.2734375 | 18 |
| 20.28125 | 19.5 |
| 20.2890625 | 21.5 |
| 20.296875 | 24 |
| 20.3046875 | 24.3 |
| 20.3125 | 18.4 |
| 20.3203125 | 9 |
| 20.328125 | -0.7 |
| 20.3359375 | -10.1 |
| 20.34375 | -17.3 |
| 20.3515625 | -24.6 |
| 20.359375 | -33.8 |
| 20.3671875 | -39.9 |
| 20.375 | -41.2 |
| 20.3828125 | -41 |
| 20.390625 | -39.9 |
| 20.3984375 | -35.2 |
| 20.40625 | -22.7 |
| 20.4140625 | -7.9 |
| 20.421875 | -1.4 |
| 20.4296875 | 0.5 |
| 20.4375 | 7.6 |
| 20.4453125 | 15.9 |
| 20.453125 | 20.6 |
| 20.4609375 | 22.7 |
| 20.46875 | 19 |
| 20.4765625 | 12.5 |
| 20.484375 | 7.8 |
| 20.4921875 | -1.1 |
| 20.5 | -9.4 |
| 20.5078125 | -7.1 |
| 20.515625 | -2.5 |
| 20.5234375 | 0.4 |
| 20.53125 | 6.3 |
| 20.5390625 | 11.8 |
| 20.546875 | 16.7 |
| 20.5546875 | 20.1 |
| 20.5625 | 15.4 |
| 20.5703125 | 9.4 |
| 20.578125 | 10.5 |
| 20.5859375 | 13.5 |
| 20.59375 | 17 |
| 20.6015625 | 23.2 |
| 20.609375 | 26.8 |
| 20.6171875 | 25.9 |
| 20.625 | 25.6 |
| 20.6328125 | 27.1 |
| 20.640625 | 28.1 |
| 20.6484375 | 32.4 |
| 20.65625 | 38.8 |
| 20.6640625 | 42.2 |
| 20.671875 | 48.3 |
| 20.6796875 | 58.1 |
| 20.6875 | 58.3 |
| 20.6953125 | 49.4 |
| 20.703125 | 42.3 |
| 20.7109375 | 38.2 |
| 20.71875 | 36.9 |
| 20.7265625 | 37.3 |
| 20.734375 | 33.8 |
| 20.7421875 | 27.5 |
| 20.75 | 25.3 |
| 20.7578125 | 26.7 |
| 20.765625 | 23 |
| 20.7734375 | 13.6 |
| 20.78125 | 8.9 |
| 20.7890625 | 7.4 |
| 20.796875 | -1.9 |
| 20.8046875 | -11.6 |
| 20.8125 | -9.2 |
| 20.8203125 | -3 |
| 20.828125 | -2 |
| 20.8359375 | -2.5 |
| 20.84375 | -4.8 |
| 20.8515625 | -9.3 |
| 20.859375 | -10.2 |
| 20.8671875 | -10.5 |
| 20.875 | -13.2 |
| 20.8828125 | -13.2 |
| 20.890625 | -14.1 |
| 20.8984375 | -17.5 |
| 20.90625 | -16.7 |
| 20.9140625 | -17.6 |
| 20.921875 | -20.2 |
| 20.9296875 | -15.8 |
| 20.9375 | -13.7 |
| 20.9453125 | -19 |
| 20.953125 | -21.3 |
| 20.9609375 | -21.4 |
| 20.96875 | -21.9 |
| 20.9765625 | -20.2 |
| 20.984375 | -18.8 |
| 20.9921875 | -15.4 |
| 21.0 | -12.3 |
| 21.0078125 | -17.5 |
| 21.015625 | -24 |
| 21.0234375 | -23.9 |
| 21.03125 | -21.4 |
| 21.0390625 | -16.6 |
| 21.046875 | -10.7 |
| 21.0546875 | -9.2 |
| 21.0625 | -10 |
| 21.0703125 | -9.3 |
| 21.078125 | -9.9 |
| 21.0859375 | -13.3 |
| 21.09375 | -18 |
| 21.1015625 | -21.6 |
| 21.109375 | -22.9 |
| 21.1171875 | -21.1 |
| 21.125 | -16.9 |
| 21.1328125 | -15.4 |
| 21.140625 | -17.8 |
| 21.1484375 | -20.8 |
| 21.15625 | -24.3 |
| 21.1640625 | -25.8 |
| 21.171875 | -22.5 |
| 21.1796875 | -22.2 |
| 21.1875 | -25.6 |
| 21.1953125 | -23 |
| 21.203125 | -15.9 |
| 21.2109375 | -11.4 |
| 21.21875 | -7.2 |
| 21.2265625 | -3.6 |
| 21.234375 | -2.3 |
| 21.2421875 | 2.9 |
| 21.25 | 10.3 |
| 21.2578125 | 11.7 |
| 21.265625 | 12.4 |
| 21.2734375 | 18 |
| 21.28125 | 22.9 |
| 21.2890625 | 27.9 |
| 21.296875 | 36.1 |
| 21.3046875 | 44.8 |
| 21.3125 | 50.3 |
| 21.3203125 | 49 |
| 21.328125 | 43.9 |
| 21.3359375 | 40.4 |
| 21.34375 | 34.5 |
| 21.3515625 | 27.2 |
| 21.359375 | 24 |
| 21.3671875 | 22 |
| 21.375 | 22.9 |
| 21.3828125 | 26.8 |
| 21.390625 | 25.5 |
| 21.3984375 | 18.5 |
| 21.40625 | 9.1 |
| 21.4140625 | -1.6 |
| 21.421875 | -8.9 |
| 21.4296875 | -11.7 |
| 21.4375 | -10 |
| 21.4453125 | -9.3 |
| 21.453125 | -14.7 |
| 21.4609375 | -17.1 |
| 21.46875 | -15.9 |
| 21.4765625 | -19.2 |
| 21.484375 | -16.4 |
| 21.4921875 | -6.8 |
| 21.5 | -4.3 |
| 21.5078125 | -6.1 |
| 21.515625 | -9.6 |
| 21.5234375 | -17.4 |
| 21.53125 | -21.8 |
| 21.5390625 | -22.7 |
| 21.546875 | -25.3 |
| 21.5546875 | -26.7 |
| 21.5625 | -26.6 |
| 21.5703125 | -27.6 |
| 21.578125 | -31.6 |
| 21.5859375 | -39.4 |
| 21.59375 | -46.2 |
| 21.6015625 | -47.8 |
| 21.609375 | -44.6 |
| 21.6171875 | -40.4 |
| 21.625 | -38.9 |
| 21.6328125 | -35.2 |
| 21.640625 | -26.9 |
| 21.6484375 | -22.5 |
| 21.65625 | -24.2 |
| 21.6640625 | -25.8 |
| 21.671875 | -26.1 |
| 21.6796875 | -26.9 |
| 21.6875 | -28.1 |
| 21.6953125 | -30.6 |
| 21.703125 | -31.8 |
| 21.7109375 | -26 |
| 21.71875 | -15.5 |
| 21.7265625 | -8.8 |
| 21.734375 | -7 |
| 21.7421875 | -7.6 |
| 21.75 | -7.8 |
| 21.7578125 | -2.3 |
| 21.765625 | 5.1 |
| 21.7734375 | 9.3 |
| 21.78125 | 17 |
| 21.7890625 | 25.8 |
| 21.796875 | 26.1 |
| 21.8046875 | 23.6 |
| 21.8125 | 26.4 |
| 21.8203125 | 35.2 |
| 21.828125 | 46.9 |
| 21.8359375 | 50.6 |
| 21.84375 | 42.4 |
| 21.8515625 | 33.2 |
| 21.859375 | 25.3 |
| 21.8671875 | 15.8 |
| 21.875 | 10 |
| 21.8828125 | 12.4 |
| 21.890625 | 19.9 |
| 21.8984375 | 23.7 |
| 21.90625 | 20.4 |
| 21.9140625 | 16.4 |
| 21.921875 | 11.6 |
| 21.9296875 | 3.4 |
| 21.9375 | -0.4 |
| 21.9453125 | 0.2 |
| 21.953125 | -1.7 |
| 21.9609375 | 1.4 |
| 21.96875 | 12.5 |
| 21.9765625 | 19.5 |
| 21.984375 | 20.2 |
| 21.9921875 | 21.2 |
| 22.0 | 23.7 |
| 22.0078125 | 26 |
| 22.015625 | 28.4 |
| 22.0234375 | 32.4 |
| 22.03125 | 35.7 |
| 22.0390625 | 36.7 |
| 22.046875 | 37.2 |
| 22.0546875 | 31.7 |
| 22.0625 | 19.5 |
| 22.0703125 | 14.2 |
| 22.078125 | 17.3 |
| 22.0859375 | 18.9 |
| 22.09375 | 18 |
| 22.1015625 | 15.1 |
| 22.109375 | 10.9 |
| 22.1171875 | 10.2 |
| 22.125 | 11.9 |
| 22.1328125 | 8.7 |
| 22.140625 | 2.4 |
| 22.1484375 | 3.1 |
| 22.15625 | 8.9 |
| 22.1640625 | 12.3 |
| 22.171875 | 16 |
| 22.1796875 | 18.7 |
| 22.1875 | 16.4 |
| 22.1953125 | 17.7 |
| 22.203125 | 22.6 |
| 22.2109375 | 22.7 |
| 22.21875 | 21.6 |
| 22.2265625 | 22.4 |
| 22.234375 | 22.5 |
| 22.2421875 | 20.6 |
| 22.25 | 14.4 |
| 22.2578125 | 9.2 |
| 22.265625 | 11 |
| 22.2734375 | 12.2 |
| 22.28125 | 7.3 |
| 22.2890625 | 1.8 |
| 22.296875 | -3 |
| 22.3046875 | -5.4 |
| 22.3125 | 0.5 |
| 22.3203125 | 6.6 |
| 22.328125 | 3.3 |
| 22.3359375 | 0.3 |
| 22.34375 | 2 |
| 22.3515625 | -1.4 |
| 22.359375 | -7.3 |
| 22.3671875 | -7.3 |
| 22.375 | -4.5 |
| 22.3828125 | -3 |
| 22.390625 | -1.6 |
| 22.3984375 | 1.5 |
| 22.40625 | 4 |
| 22.4140625 | 4.3 |
| 22.421875 | 3 |
| 22.4296875 | -3 |
| 22.4375 | -10.2 |
| 22.4453125 | -14.2 |
| 22.453125 | -21.8 |
| 22.4609375 | -30.6 |
| 22.46875 | -34.1 |
| 22.4765625 | -38.4 |
| 22.484375 | -39.5 |
| 22.4921875 | -31.1 |
| 22.5 | -25.6 |
| 22.5078125 | -24.5 |
| 22.515625 | -21.1 |
| 22.5234375 | -22.5 |
| 22.53125 | -26.9 |
| 22.5390625 | -24.8 |
| 22.546875 | -21.7 |
| 22.5546875 | -19.1 |
| 22.5625 | -11 |
| 22.5703125 | -4.8 |
| 22.578125 | -4.1 |
| 22.5859375 | 0.5 |
| 22.59375 | 6 |
| 22.6015625 | 4.3 |
| 22.609375 | 0.5 |
| 22.6171875 | -0.5 |
| 22.625 | 1.1 |
| 22.6328125 | 4.4 |
| 22.640625 | 5.4 |
| 22.6484375 | 4.1 |
| 22.65625 | 5.9 |
| 22.6640625 | 8.8 |
| 22.671875 | 7.7 |
| 22.6796875 | 2.3 |
| 22.6875 | -3.3 |
| 22.6953125 | -6.1 |
| 22.703125 | -6.1 |
| 22.7109375 | -3.9 |
| 22.71875 | -1.5 |
| 22.7265625 | 0.3 |
| 22.734375 | 3.4 |
| 22.7421875 | 6.8 |
| 22.75 | 8.6 |
| 22.7578125 | 10.9 |
| 22.765625 | 13.4 |
| 22.7734375 | 12.9 |
| 22.78125 | 5.1 |
| 22.7890625 | -8.3 |
| 22.796875 | -13.2 |
| 22.8046875 | -8.5 |
| 22.8125 | -9.6 |
| 22.8203125 | -13.6 |
| 22.828125 | -10.8 |
| 22.8359375 | -9.3 |
| 22.84375 | -12.2 |
| 22.8515625 | -12.6 |
| 22.859375 | -11.9 |
| 22.8671875 | -13.1 |
| 22.875 | -13.5 |
| 22.8828125 | -10.5 |
| 22.890625 | -5.4 |
| 22.8984375 | 0.7 |
| 22.90625 | 8.4 |
| 22.9140625 | 11.7 |
| 22.921875 | 10.4 |
| 22.9296875 | 16.5 |
| 22.9375 | 27.7 |
| 22.9453125 | 30.9 |
| 22.953125 | 30.1 |
| 22.9609375 | 30.6 |
| 22.96875 | 28.8 |
| 22.9765625 | 25.6 |
| 22.984375 | 20.5 |
| 22.9921875 | 11.6 |
| 23.0 | 5.7 |
| 23.0078125 | 1.9 |
| 23.015625 | -7 |
| 23.0234375 | -16.5 |
| 23.03125 | -19.1 |
| 23.0390625 | -15.9 |
| 23.046875 | -13 |
| 23.0546875 | -15.6 |
| 23.0625 | -16.6 |
| 23.0703125 | -8.9 |
| 23.078125 | -2.3 |
| 23.0859375 | -2.4 |
| 23.09375 | -4.5 |
| 23.1015625 | -10.6 |
| 23.109375 | -15.4 |
| 23.1171875 | -12.9 |
| 23.125 | -12.4 |
| 23.1328125 | -13.5 |
| 23.140625 | -11.4 |
| 23.1484375 | -14.3 |
| 23.15625 | -19.4 |
| 23.1640625 | -20.3 |
| 23.171875 | -23.4 |
| 23.1796875 | -27.1 |
| 23.1875 | -27.9 |
| 23.1953125 | -32.3 |
| 23.203125 | -37.2 |
| 23.2109375 | -37 |
| 23.21875 | -36.7 |
| 23.2265625 | -38 |
| 23.234375 | -39.7 |
| 23.2421875 | -43.6 |
| 23.25 | -44.6 |
| 23.2578125 | -38.3 |
| 23.265625 | -30.2 |
| 23.2734375 | -24.7 |
| 23.28125 | -21.5 |
| 23.2890625 | -21.1 |
| 23.296875 | -21.5 |
| 23.3046875 | -20.1 |
| 23.3125 | -19.3 |
| 23.3203125 | -17.4 |
| 23.328125 | -13.1 |
| 23.3359375 | -12.8 |
| 23.34375 | -15.6 |
| 23.3515625 | -12.3 |
| 23.359375 | -5.3 |
| 23.3671875 | -2.3 |
| 23.375 | -1.2 |
| 23.3828125 | -0.8 |
| 23.390625 | -4.7 |
| 23.3984375 | -9 |
| 23.40625 | -8.9 |
| 23.4140625 | -9.5 |
| 23.421875 | -13.6 |
| 23.4296875 | -16.4 |
| 23.4375 | -17.2 |
| 23.4453125 | -21.6 |
| 23.453125 | -28.6 |
| 23.4609375 | -29.9 |
| 23.46875 | -26.9 |
| 23.4765625 | -27.3 |
| 23.484375 | -26.8 |
| 23.4921875 | -22.8 |
| 23.5 | -20.5 |
| 23.5078125 | -19.9 |
| 23.515625 | -18.7 |
| 23.5234375 | -16.1 |
| 23.53125 | -12.8 |
| 23.5390625 | -12.2 |
| 23.546875 | -11.1 |
| 23.5546875 | -6.4 |
| 23.5625 | -2.9 |
| 23.5703125 | 2 |
| 23.578125 | 10.6 |
| 23.5859375 | 16.8 |
| 23.59375 | 21.9 |
| 23.6015625 | 26 |
| 23.609375 | 25.3 |
| 23.6171875 | 24.6 |
| 23.625 | 21.8 |
| 23.6328125 | 13 |
| 23.640625 | 10.6 |
| 23.6484375 | 15.6 |
| 23.65625 | 14.4 |
| 23.6640625 | 10.3 |
| 23.671875 | 11.6 |
| 23.6796875 | 10 |
| 23.6875 | 2.6 |
| 23.6953125 | 0.8 |
| 23.703125 | 6.8 |
| 23.7109375 | 15.4 |
| 23.71875 | 26.1 |
| 23.7265625 | 34.3 |
| 23.734375 | 34.3 |
| 23.7421875 | 29.9 |
| 23.75 | 25.6 |
| 23.7578125 | 23.3 |
| 23.765625 | 24.3 |
| 23.7734375 | 28.5 |
| 23.78125 | 40.3 |
| 23.7890625 | 54.9 |
| 23.796875 | 63.8 |
| 23.8046875 | 74.5 |
| 23.8125 | 86.1 |
| 23.8203125 | 87 |
| 23.828125 | 88.1 |
| 23.8359375 | 98.6 |
| 23.84375 | 108.1 |
| 23.8515625 | 114.6 |
| 23.859375 | 119.2 |
| 23.8671875 | 118.2 |
| 23.875 | 115.6 |
| 23.8828125 | 114.9 |
| 23.890625 | 116.9 |
| 23.8984375 | 121.3 |
| 23.90625 | 122.4 |
| 23.9140625 | 122.6 |
| 23.921875 | 127.4 |
| 23.9296875 | 129.4 |
| 23.9375 | 129 |
| 23.9453125 | 132.5 |
| 23.953125 | 132.6 |
| 23.9609375 | 128.2 |
| 23.96875 | 125.5 |
| 23.9765625 | 117.1 |
| 23.984375 | 102.1 |
| 23.9921875 | 91 |
| 24.0 | 81.5 |
| 24.0078125 | 65.4 |
| 24.015625 | 45.4 |
| 24.0234375 | 25.2 |
| 24.03125 | 1.7 |
| 24.0390625 | -24.9 |
| 24.046875 | -44.8 |
| 24.0546875 | -55.4 |
| 24.0625 | -67.4 |
| 24.0703125 | -82.2 |
| 24.078125 | -92.3 |
| 24.0859375 | -97.8 |
| 24.09375 | -99.3 |
| 24.1015625 | -95.6 |
| 24.109375 | -89.3 |
| 24.1171875 | -79.9 |
| 24.125 | -65 |
| 24.1328125 | -45.5 |
| 24.140625 | -24.8 |
| 24.1484375 | -6.8 |
| 24.15625 | 9.3 |
| 24.1640625 | 25 |
| 24.171875 | 33.1 |
| 24.1796875 | 27 |
| 24.1875 | 11.2 |
| 24.1953125 | -9.3 |
| 24.203125 | -33.8 |
| 24.2109375 | -63.2 |
| 24.21875 | -97.4 |
| 24.2265625 | -129.7 |
| 24.234375 | -152.7 |
| 24.2421875 | -165.9 |
| 24.25 | -172 |
| 24.2578125 | -174.1 |
| 24.265625 | -174 |
| 24.2734375 | -171.7 |
| 24.28125 | -169.4 |
| 24.2890625 | -162.8 |
| 24.296875 | -142.6 |
| 24.3046875 | -115.5 |
| 24.3125 | -93.3 |
| 24.3203125 | -77.4 |
| 24.328125 | -74.3 |
| 24.3359375 | -91.9 |
| 24.34375 | -120.8 |
| 24.3515625 | -147.9 |
| 24.359375 | -168 |
| 24.3671875 | -178.5 |
| 24.375 | -184.3 |
| 24.3828125 | -190.8 |
| 24.390625 | -191.6 |
| 24.3984375 | -186.9 |
| 24.40625 | -184.9 |
| 24.4140625 | -178.4 |
| 24.421875 | -161.2 |
| 24.4296875 | -143.2 |
| 24.4375 | -125.9 |
| 24.4453125 | -104.2 |
| 24.453125 | -81.3 |
| 24.4609375 | -59.2 |
| 24.46875 | -34.3 |
| 24.4765625 | -6 |
| 24.484375 | 19.9 |
| 24.4921875 | 36.2 |
| 24.5 | 44 |
| 24.5078125 | 46.8 |
| 24.515625 | 45.3 |
| 24.5234375 | 42.3 |
| 24.53125 | 39.4 |
| 24.5390625 | 35.4 |
| 24.546875 | 30.5 |
| 24.5546875 | 26.6 |
| 24.5625 | 25.2 |
| 24.5703125 | 26.7 |
| 24.578125 | 31.3 |
| 24.5859375 | 35.7 |
| 24.59375 | 37.8 |
| 24.6015625 | 43.1 |
| 24.609375 | 55.1 |
| 24.6171875 | 67 |
| 24.625 | 73.2 |
| 24.6328125 | 75.2 |
| 24.640625 | 75.7 |
| 24.6484375 | 71.2 |
| 24.65625 | 57.8 |
| 24.6640625 | 41.2 |
| 24.671875 | 27.4 |
| 24.6796875 | 18.4 |
| 24.6875 | 16.5 |
| 24.6953125 | 19.1 |
| 24.703125 | 23.4 |
| 24.7109375 | 32.8 |
| 24.71875 | 47.5 |
| 24.7265625 | 64.3 |
| 24.734375 | 80.6 |
| 24.7421875 | 92.9 |
| 24.75 | 100.6 |
| 24.7578125 | 106.7 |
| 24.765625 | 110.3 |
| 24.7734375 | 107.5 |
| 24.78125 | 99 |
| 24.7890625 | 89.3 |
| 24.796875 | 75.6 |
| 24.8046875 | 53.3 |
| 24.8125 | 23.2 |
| 24.8203125 | -12.3 |
| 24.828125 | -41.6 |
| 24.8359375 | -53.2 |
| 24.84375 | -54.7 |
| 24.8515625 | -51.4 |
| 24.859375 | -40.7 |
| 24.8671875 | -35.6 |
| 24.875 | -39.5 |
| 24.8828125 | -35.9 |
| 24.890625 | -27.3 |
| 24.8984375 | -25.3 |
| 24.90625 | -26.2 |
| 24.9140625 | -27.2 |
| 24.921875 | -26.3 |
| 24.9296875 | -19.8 |
| 24.9375 | -14.1 |
| 24.9453125 | -16.1 |
| 24.953125 | -25.8 |
| 24.9609375 | -37.9 |
| 24.96875 | -41.3 |
| 24.9765625 | -35.5 |
| 24.984375 | -27.5 |
| 24.9921875 | -12.3 |
| 25.0 | 10 |
| 25.0078125 | 32.1 |
| 25.015625 | 59.3 |
| 25.0234375 | 87.1 |
| 25.03125 | 99.3 |
| 25.0390625 | 101.5 |
| 25.046875 | 104.1 |
| 25.0546875 | 102.5 |
| 25.0625 | 97.3 |
| 25.0703125 | 94.5 |
| 25.078125 | 93.8 |
| 25.0859375 | 95.1 |
| 25.09375 | 93.9 |
| 25.1015625 | 85 |
| 25.109375 | 74.1 |
| 25.1171875 | 63.4 |
| 25.125 | 51.4 |
| 25.1328125 | 44 |
| 25.140625 | 41.3 |
| 25.1484375 | 38.7 |
| 25.15625 | 41.2 |
| 25.1640625 | 50.7 |
| 25.171875 | 58.7 |
| 25.1796875 | 60.7 |
| 25.1875 | 57.9 |
| 25.1953125 | 52.9 |
| 25.203125 | 48.9 |
| 25.2109375 | 44.4 |
| 25.21875 | 41.4 |
| 25.2265625 | 49 |
| 25.234375 | 64.1 |
| 25.2421875 | 76.1 |
| 25.25 | 82.8 |
| 25.2578125 | 82.6 |
| 25.265625 | 78.5 |
| 25.2734375 | 78 |
| 25.28125 | 77 |
| 25.2890625 | 77.3 |
| 25.296875 | 85.4 |
| 25.3046875 | 92.1 |
| 25.3125 | 97.8 |
| 25.3203125 | 107.3 |
| 25.328125 | 109.8 |
| 25.3359375 | 108.5 |
| 25.34375 | 111.2 |
| 25.3515625 | 107.8 |
| 25.359375 | 100.8 |
| 25.3671875 | 98.9 |
| 25.375 | 98 |
| 25.3828125 | 100.5 |
| 25.390625 | 108.5 |
| 25.3984375 | 115.8 |
| 25.40625 | 123.6 |
| 25.4140625 | 134.5 |
| 25.421875 | 144.7 |
| 25.4296875 | 151.1 |
| 25.4375 | 154.6 |
| 25.4453125 | 154 |
| 25.453125 | 147.2 |
| 25.4609375 | 137.9 |
| 25.46875 | 126.8 |
| 25.4765625 | 113 |
| 25.484375 | 105.5 |
| 25.4921875 | 100.4 |
| 25.5 | 85.4 |
| 25.5078125 | 69 |
| 25.515625 | 53.7 |
| 25.5234375 | 26.9 |
| 25.53125 | -5.7 |
| 25.5390625 | -33.7 |
| 25.546875 | -58.8 |
| 25.5546875 | -80.2 |
| 25.5625 | -101 |
| 25.5703125 | -124.2 |
| 25.578125 | -141.3 |
| 25.5859375 | -149.9 |
| 25.59375 | -157.7 |
| 25.6015625 | -163.2 |
| 25.609375 | -162.5 |
| 25.6171875 | -160.9 |
| 25.625 | -160.7 |
| 25.6328125 | -159.4 |
| 25.640625 | -160.1 |
| 25.6484375 | -161 |
| 25.65625 | -154.2 |
| 25.6640625 | -145.3 |
| 25.671875 | -144 |
| 25.6796875 | -147.6 |
| 25.6875 | -154.4 |
| 25.6953125 | -164.8 |
| 25.703125 | -173.8 |
| 25.7109375 | -181.6 |
| 25.71875 | -188.7 |
| 25.7265625 | -190.9 |
| 25.734375 | -191.2 |
| 25.7421875 | -191.2 |
| 25.75 | -184.7 |
| 25.7578125 | -175 |
| 25.765625 | -164.5 |
| 25.7734375 | -145.8 |
| 25.78125 | -122.7 |
| 25.7890625 | -103 |
| 25.796875 | -85.4 |
| 25.8046875 | -72.5 |
| 25.8125 | -67.2 |
| 25.8203125 | -64.2 |
| 25.828125 | -59.2 |
| 25.8359375 | -50.9 |
| 25.84375 | -41.3 |
| 25.8515625 | -35.6 |
| 25.859375 | -31.2 |
| 25.8671875 | -20.3 |
| 25.875 | -5.9 |
| 25.8828125 | 3.5 |
| 25.890625 | 7.8 |
| 25.8984375 | 10.1 |
| 25.90625 | 10.8 |
| 25.9140625 | 11.3 |
| 25.921875 | 12.9 |
| 25.9296875 | 12.7 |
| 25.9375 | 7.7 |
| 25.9453125 | 0.5 |
| 25.953125 | -2.2 |
| 25.9609375 | -1 |
| 25.96875 | -0.4 |
| 25.9765625 | 4.4 |
| 25.984375 | 11.6 |
| 25.9921875 | 11.8 |
| 26.0 | 12.3 |
| 26.0078125 | 19.3 |
| 26.015625 | 23.7 |
| 26.0234375 | 30.9 |
| 26.03125 | 48.1 |
| 26.0390625 | 66.1 |
| 26.046875 | 82.1 |
| 26.0546875 | 98 |
| 26.0625 | 112.9 |
| 26.0703125 | 130.3 |
| 26.078125 | 144.2 |
| 26.0859375 | 147.7 |
| 26.09375 | 148.2 |
| 26.1015625 | 146.4 |
| 26.109375 | 138.9 |
| 26.1171875 | 133.3 |
| 26.125 | 127.1 |
| 26.1328125 | 111.8 |
| 26.140625 | 96.2 |
| 26.1484375 | 89.4 |
| 26.15625 | 85.6 |
| 26.1640625 | 83.4 |
| 26.171875 | 84.2 |
| 26.1796875 | 80.6 |
| 26.1875 | 71 |
| 26.1953125 | 60 |
| 26.203125 | 48.2 |
| 26.2109375 | 40.6 |
| 26.21875 | 40.1 |
| 26.2265625 | 39.8 |
| 26.234375 | 34.2 |
| 26.2421875 | 22.3 |
| 26.25 | 8 |
| 26.2578125 | -3.1 |
| 26.265625 | -16.4 |
| 26.2734375 | -34.2 |
| 26.28125 | -48 |
| 26.2890625 | -57.9 |
| 26.296875 | -68.5 |
| 26.3046875 | -78.9 |
| 26.3125 | -88.8 |
| 26.3203125 | -95.1 |
| 26.328125 | -94.9 |
| 26.3359375 | -94.9 |
| 26.34375 | -99 |
| 26.3515625 | -102.2 |
| 26.359375 | -103.8 |
| 26.3671875 | -107.8 |
| 26.375 | -114.6 |
| 26.3828125 | -119.5 |
| 26.390625 | -119.5 |
| 26.3984375 | -120.1 |
| 26.40625 | -124.4 |
| 26.4140625 | -127.6 |
| 26.421875 | -132.5 |
| 26.4296875 | -138.6 |
| 26.4375 | -133.4 |
| 26.4453125 | -124.3 |
| 26.453125 | -126.6 |
| 26.4609375 | -132.6 |
| 26.46875 | -140.3 |
| 26.4765625 | -151.2 |
| 26.484375 | -154.1 |
| 26.4921875 | -151.8 |
| 26.5 | -150.9 |
| 26.5078125 | -146.2 |
| 26.515625 | -143.7 |
| 26.5234375 | -148.1 |
| 26.53125 | -151.9 |
| 26.5390625 | -151.7 |
| 26.546875 | -148.4 |
| 26.5546875 | -148.7 |
| 26.5625 | -155.9 |
| 26.5703125 | -160 |
| 26.578125 | -159.5 |
| 26.5859375 | -160.5 |
| 26.59375 | -159.9 |
| 26.6015625 | -155.1 |
| 26.609375 | -148.7 |
| 26.6171875 | -143.3 |
| 26.625 | -136.4 |
| 26.6328125 | -126 |
| 26.640625 | -119.2 |
| 26.6484375 | -112.6 |
| 26.65625 | -96.3 |
| 26.6640625 | -77.1 |
| 26.671875 | -59.9 |
| 26.6796875 | -41.6 |
| 26.6875 | -23.2 |
| 26.6953125 | -5.3 |
| 26.703125 | 7.5 |
| 26.7109375 | 14.3 |
| 26.71875 | 25.3 |
| 26.7265625 | 38.2 |
| 26.734375 | 46.2 |
| 26.7421875 | 56.7 |
| 26.75 | 71.8 |
| 26.7578125 | 84.5 |
| 26.765625 | 92.1 |
| 26.7734375 | 96.8 |
| 26.78125 | 100 |
| 26.7890625 | 100.2 |
| 26.796875 | 98.9 |
| 26.8046875 | 99.5 |
| 26.8125 | 104.2 |
| 26.8203125 | 115.5 |
| 26.828125 | 129.4 |
| 26.8359375 | 143.1 |
| 26.84375 | 159.4 |
| 26.8515625 | 171.4 |
| 26.859375 | 178.8 |
| 26.8671875 | 193.5 |
| 26.875 | 213.2 |
| 26.8828125 | 232.3 |
| 26.890625 | 256.3 |
| 26.8984375 | 287.9 |
| 26.90625 | 318.7 |
| 26.9140625 | 336.1 |
| 26.921875 | 340.6 |
| 26.9296875 | 338.8 |
| 26.9375 | 324.7 |
| 26.9453125 | 298 |
| 26.953125 | 268.7 |
| 26.9609375 | 237.7 |
| 26.96875 | 206.1 |
| 26.9765625 | 181.3 |
| 26.984375 | 164.8 |
| 26.9921875 | 154.1 |
| 27.0 | 145.6 |
| 27.0078125 | 137.1 |
| 27.015625 | 124.5 |
| 27.0234375 | 97.7 |
| 27.03125 | 61.8 |
| 27.0390625 | 35.3 |
| 27.046875 | 19.6 |
| 27.0546875 | 9.3 |
| 27.0625 | 10.5 |
| 27.0703125 | 18 |
| 27.078125 | 18.2 |
| 27.0859375 | 9.7 |
| 27.09375 | -0.9 |
| 27.1015625 | -8.3 |
| 27.109375 | -10.7 |
| 27.1171875 | -6.4 |
| 27.125 | 3.7 |
| 27.1328125 | 15.8 |
| 27.140625 | 30.8 |
| 27.1484375 | 46.8 |
| 27.15625 | 57.8 |
| 27.1640625 | 65.2 |
| 27.171875 | 69.5 |
| 27.1796875 | 68.1 |
| 27.1875 | 68 |
| 27.1953125 | 68.5 |
| 27.203125 | 54.2 |
| 27.2109375 | 24 |
| 27.21875 | -8.2 |
| 27.2265625 | -36.1 |
| 27.234375 | -57.1 |
| 27.2421875 | -60.8 |
| 27.25 | -48.4 |
| 27.2578125 | -41.8 |
| 27.265625 | -49.3 |
| 27.2734375 | -60.9 |
| 27.28125 | -77.2 |
| 27.2890625 | -100.9 |
| 27.296875 | -124.8 |
| 27.3046875 | -142.8 |
| 27.3125 | -153.5 |
| 27.3203125 | -159.4 |
| 27.328125 | -164.5 |
| 27.3359375 | -167.5 |
| 27.34375 | -164.5 |
| 27.3515625 | -154 |
| 27.359375 | -143.1 |
| 27.3671875 | -142.6 |
| 27.375 | -145.6 |
| 27.3828125 | -139.8 |
| 27.390625 | -133.6 |
| 27.3984375 | -135.5 |
| 27.40625 | -141.4 |
| 27.4140625 | -149.2 |
| 27.421875 | -154.6 |
| 27.4296875 | -154.1 |
| 27.4375 | -153 |
| 27.4453125 | -154.7 |
| 27.453125 | -157.8 |
| 27.4609375 | -158.4 |
| 27.46875 | -154.3 |
| 27.4765625 | -151 |
| 27.484375 | -151 |
| 27.4921875 | -151.1 |
| 27.5 | -150.8 |
| 27.5078125 | -147 |
| 27.515625 | -138.9 |
| 27.5234375 | -131.1 |
| 27.53125 | -124.5 |
| 27.5390625 | -117.7 |
| 27.546875 | -107.6 |
| 27.5546875 | -94 |
| 27.5625 | -86.2 |
| 27.5703125 | -84.8 |
| 27.578125 | -81.6 |
| 27.5859375 | -75.7 |
| 27.59375 | -63.2 |
| 27.6015625 | -42.9 |
| 27.609375 | -26 |
| 27.6171875 | -15.5 |
| 27.625 | -5.8 |
| 27.6328125 | 2.5 |
| 27.640625 | 10.7 |
| 27.6484375 | 19.3 |
| 27.65625 | 22.3 |
| 27.6640625 | 20.8 |
| 27.671875 | 20.5 |
| 27.6796875 | 19.6 |
| 27.6875 | 18.5 |
| 27.6953125 | 22.6 |
| 27.703125 | 30.1 |
| 27.7109375 | 36.9 |
| 27.71875 | 44.3 |
| 27.7265625 | 53.5 |
| 27.734375 | 64 |
| 27.7421875 | 76.1 |
| 27.75 | 89.2 |
| 27.7578125 | 101 |
| 27.765625 | 108.7 |
| 27.7734375 | 110.8 |
| 27.78125 | 108.3 |
| 27.7890625 | 101.8 |
| 27.796875 | 91.5 |
| 27.8046875 | 81.5 |
| 27.8125 | 75.8 |
| 27.8203125 | 71.5 |
| 27.828125 | 65 |
| 27.8359375 | 61.4 |
| 27.84375 | 64.4 |
| 27.8515625 | 69.3 |
| 27.859375 | 75.5 |
| 27.8671875 | 86.2 |
| 27.875 | 95.3 |
| 27.8828125 | 97.4 |
| 27.890625 | 96 |
| 27.8984375 | 93.7 |
| 27.90625 | 90.3 |
| 27.9140625 | 86 |
| 27.921875 | 83.5 |
| 27.9296875 | 84.5 |
| 27.9375 | 86.7 |
| 27.9453125 | 89.2 |
| 27.953125 | 91.7 |
| 27.9609375 | 87.2 |
| 27.96875 | 77.3 |
| 27.9765625 | 71.2 |
| 27.984375 | 66.5 |
| 27.9921875 | 61.5 |
| 28.0 | 63.3 |
| 28.0078125 | 66.4 |
| 28.015625 | 63 |
| 28.0234375 | 58.9 |
| 28.03125 | 53.7 |
| 28.0390625 | 44.2 |
| 28.046875 | 37.4 |
| 28.0546875 | 35.1 |
| 28.0625 | 34.3 |
| 28.0703125 | 35.1 |
| 28.078125 | 35.3 |
| 28.0859375 | 38.5 |
| 28.09375 | 49.6 |
| 28.1015625 | 57.8 |
| 28.109375 | 55.1 |
| 28.1171875 | 51.9 |
| 28.125 | 51.9 |
| 28.1328125 | 46.5 |
| 28.140625 | 40.7 |
| 28.1484375 | 44.2 |
| 28.15625 | 48.1 |
| 28.1640625 | 46.7 |
| 28.171875 | 49.2 |
| 28.1796875 | 51.5 |
| 28.1875 | 44 |
| 28.1953125 | 36.4 |
| 28.203125 | 33.1 |
| 28.2109375 | 27 |
| 28.21875 | 22.9 |
| 28.2265625 | 22.8 |
| 28.234375 | 21 |
| 28.2421875 | 21.8 |
| 28.25 | 26.8 |
| 28.2578125 | 27.5 |
| 28.265625 | 25.9 |
| 28.2734375 | 27.5 |
| 28.28125 | 30.2 |
| 28.2890625 | 34.4 |
| 28.296875 | 42.9 |
| 28.3046875 | 50.8 |
| 28.3125 | 54.2 |
| 28.3203125 | 58.5 |
| 28.328125 | 62 |
| 28.3359375 | 54 |
| 28.34375 | 41.9 |
| 28.3515625 | 38.8 |
| 28.359375 | 37.6 |
| 28.3671875 | 31.3 |
| 28.375 | 25.9 |
| 28.3828125 | 24.2 |
| 28.390625 | 25.9 |
| 28.3984375 | 32 |
| 28.40625 | 40.4 |
| 28.4140625 | 46.4 |
| 28.421875 | 46.8 |
| 28.4296875 | 43 |
| 28.4375 | 34.9 |
| 28.4453125 | 26.3 |
| 28.453125 | 25 |
| 28.4609375 | 22.1 |
| 28.46875 | 11.1 |
| 28.4765625 | 6.1 |
| 28.484375 | 4.6 |
| 28.4921875 | -1.9 |
| 28.5 | -3.2 |
| 28.5078125 | -2.8 |
| 28.515625 | -10.1 |
| 28.5234375 | -12.5 |
| 28.53125 | -6.7 |
| 28.5390625 | -5.7 |
| 28.546875 | -10.3 |
| 28.5546875 | -11.1 |
| 28.5625 | -7.7 |
| 28.5703125 | -7.6 |
| 28.578125 | -14.1 |
| 28.5859375 | -23.4 |
| 28.59375 | -34.5 |
| 28.6015625 | -48.2 |
| 28.609375 | -57.6 |
| 28.6171875 | -56.8 |
| 28.625 | -56 |
| 28.6328125 | -64.8 |
| 28.640625 | -72.9 |
| 28.6484375 | -73.9 |
| 28.65625 | -76.4 |
| 28.6640625 | -78.3 |
| 28.671875 | -71.7 |
| 28.6796875 | -61.6 |
| 28.6875 | -55.6 |
| 28.6953125 | -51.5 |
| 28.703125 | -41.5 |
| 28.7109375 | -29 |
| 28.71875 | -27.4 |
| 28.7265625 | -33.3 |
| 28.734375 | -36.9 |
| 28.7421875 | -40.9 |
| 28.75 | -43.9 |
| 28.7578125 | -44.3 |
| 28.765625 | -44.7 |
| 28.7734375 | -39.9 |
| 28.78125 | -34.7 |
| 28.7890625 | -38.8 |
| 28.796875 | -40.4 |
| 28.8046875 | -32.3 |
| 28.8125 | -26.6 |
| 28.8203125 | -26.7 |
| 28.828125 | -27.4 |
| 28.8359375 | -29.7 |
| 28.84375 | -33.2 |
| 28.8515625 | -34.6 |
| 28.859375 | -34.7 |
| 28.8671875 | -34.9 |
| 28.875 | -31.6 |
| 28.8828125 | -27.6 |
| 28.890625 | -30.6 |
| 28.8984375 | -35.2 |
| 28.90625 | -33.9 |
| 28.9140625 | -31.5 |
| 28.921875 | -29.8 |
| 28.9296875 | -26.2 |
| 28.9375 | -22.6 |
| 28.9453125 | -20.4 |
| 28.953125 | -20.8 |
| 28.9609375 | -24.1 |
| 28.96875 | -26.3 |
| 28.9765625 | -28.1 |
| 28.984375 | -33.8 |
| 28.9921875 | -38.2 |
| 29.0 | -36.2 |
| 29.0078125 | -32 |
| 29.015625 | -26.9 |
| 29.0234375 | -19.7 |
| 29.03125 | -16 |
| 29.0390625 | -17.8 |
| 29.046875 | -18.9 |
| 29.0546875 | -13.3 |
| 29.0625 | -4.6 |
| 29.0703125 | -0.7 |
| 29.078125 | -2.1 |
| 29.0859375 | -5.3 |
| 29.09375 | -8.7 |
| 29.1015625 | -9.7 |
| 29.109375 | -9.1 |
| 29.1171875 | -9 |
| 29.125 | -9.3 |
| 29.1328125 | -11.6 |
| 29.140625 | -11.4 |
| 29.1484375 | -6.8 |
| 29.15625 | -6.2 |
| 29.1640625 | -7 |
| 29.171875 | -5.8 |
| 29.1796875 | -12 |
| 29.1875 | -23.5 |
| 29.1953125 | -30.1 |
| 29.203125 | -31.7 |
| 29.2109375 | -29.7 |
| 29.21875 | -28.6 |
| 29.2265625 | -31.2 |
| 29.234375 | -32.4 |
| 29.2421875 | -33.5 |
| 29.25 | -37.5 |
| 29.2578125 | -39.2 |
| 29.265625 | -39.2 |
| 29.2734375 | -40.2 |
| 29.28125 | -38.8 |
| 29.2890625 | -36.1 |
| 29.296875 | -34.7 |
| 29.3046875 | -31 |
| 29.3125 | -27.1 |
| 29.3203125 | -28 |
| 29.328125 | -31 |
| 29.3359375 | -31 |
| 29.34375 | -27.9 |
| 29.3515625 | -25.4 |
| 29.359375 | -26 |
| 29.3671875 | -26.7 |
| 29.375 | -26.1 |
| 29.3828125 | -27.6 |
| 29.390625 | -29.9 |
| 29.3984375 | -30 |
| 29.40625 | -26.9 |
| 29.4140625 | -22.3 |
| 29.421875 | -23 |
| 29.4296875 | -26 |
| 29.4375 | -22.2 |
| 29.4453125 | -19 |
| 29.453125 | -20.8 |
| 29.4609375 | -20.1 |
| 29.46875 | -22 |
| 29.4765625 | -30.4 |
| 29.484375 | -36.1 |
| 29.4921875 | -38 |
| 29.5 | -41.7 |
| 29.5078125 | -48.5 |
| 29.515625 | -55.7 |
| 29.5234375 | -58 |
| 29.53125 | -56.8 |
| 29.5390625 | -56.4 |
| 29.546875 | -54.5 |
| 29.5546875 | -48.2 |
| 29.5625 | -37.8 |
| 29.5703125 | -28.9 |
| 29.578125 | -30.1 |
| 29.5859375 | -34.3 |
| 29.59375 | -27.9 |
| 29.6015625 | -21.2 |
| 29.609375 | -24.9 |
| 29.6171875 | -22.1 |
| 29.625 | -6.9 |
| 29.6328125 | 3.3 |
| 29.640625 | 8.1 |
| 29.6484375 | 14.9 |
| 29.65625 | 18 |
| 29.6640625 | 18 |
| 29.671875 | 17.9 |
| 29.6796875 | 17.5 |
| 29.6875 | 23.3 |
| 29.6953125 | 30.7 |
| 29.703125 | 28.6 |
| 29.7109375 | 26.7 |
| 29.71875 | 31.3 |
| 29.7265625 | 33.4 |
| 29.734375 | 37 |
| 29.7421875 | 44.6 |
| 29.75 | 45.4 |
| 29.7578125 | 41.3 |
| 29.765625 | 42.7 |
| 29.7734375 | 46.6 |
| 29.78125 | 43.9 |
| 29.7890625 | 35 |
| 29.796875 | 26.5 |
| 29.8046875 | 15.3 |
| 29.8125 | -0.4 |
| 29.8203125 | -6.6 |
| 29.828125 | -1.9 |
| 29.8359375 | 0.9 |
| 29.84375 | 3.2 |
| 29.8515625 | 5.8 |
| 29.859375 | 6.1 |
| 29.8671875 | 9.5 |
| 29.875 | 10.4 |
| 29.8828125 | 4.3 |
| 29.890625 | -0.6 |
| 29.8984375 | -5.9 |
| 29.90625 | -10.5 |
| 29.9140625 | -9.7 |
| 29.921875 | -11.7 |
| 29.9296875 | -13.5 |
| 29.9375 | -9.8 |
| 29.9453125 | -9.5 |
| 29.953125 | -8.6 |
| 29.9609375 | -1.9 |
| 29.96875 | 1.2 |
| 29.9765625 | 6.4 |
| 29.984375 | 19.1 |
| 29.9921875 | 24.7 |
| 30.0 | 23.2 |
| 30.0078125 | 28.4 |
| 30.015625 | 38.2 |
| 30.0234375 | 43.1 |
| 30.03125 | 42.9 |
| 30.0390625 | 42.6 |
| 30.046875 | 43.9 |
| 30.0546875 | 43.4 |
| 30.0625 | 37.6 |
| 30.0703125 | 27 |
| 30.078125 | 17.9 |
| 30.0859375 | 17.6 |
| 30.09375 | 22 |
| 30.1015625 | 22.3 |
| 30.109375 | 20.1 |
| 30.1171875 | 18.9 |
| 30.125 | 18.7 |
| 30.1328125 | 18.2 |
| 30.140625 | 15.3 |
| 30.1484375 | 11.6 |
| 30.15625 | 8.9 |
| 30.1640625 | 4.6 |
| 30.171875 | -0.9 |
| 30.1796875 | -3.5 |
| 30.1875 | -2.5 |
| 30.1953125 | 0.8 |
| 30.203125 | 2.2 |
| 30.2109375 | -1.9 |
| 30.21875 | -5.8 |
| 30.2265625 | -2.2 |
| 30.234375 | 4.6 |
| 30.2421875 | 10.2 |
| 30.25 | 18.3 |
| 30.2578125 | 24 |
| 30.265625 | 23.6 |
| 30.2734375 | 25.6 |
| 30.28125 | 26.8 |
| 30.2890625 | 22.7 |
| 30.296875 | 23.9 |
| 30.3046875 | 28.5 |
| 30.3125 | 27.1 |
| 30.3203125 | 25.1 |
| 30.328125 | 23.2 |
| 30.3359375 | 21.6 |
| 30.34375 | 29.7 |
| 30.3515625 | 41.9 |
| 30.359375 | 45.9 |
| 30.3671875 | 45.2 |
| 30.375 | 45.6 |
| 30.3828125 | 44.1 |
| 30.390625 | 36.8 |
| 30.3984375 | 26.9 |
| 30.40625 | 20.4 |
| 30.4140625 | 17 |
| 30.421875 | 15.7 |
| 30.4296875 | 17.4 |
| 30.4375 | 20.9 |
| 30.4453125 | 27.4 |
| 30.453125 | 35 |
| 30.4609375 | 36.6 |
| 30.46875 | 30.8 |
| 30.4765625 | 21.4 |
| 30.484375 | 14.3 |
| 30.4921875 | 13 |
| 30.5 | 13.1 |
| 30.5078125 | 11.4 |
| 30.515625 | 9.3 |
| 30.5234375 | 8.4 |
| 30.53125 | 11.2 |
| 30.5390625 | 12.3 |
| 30.546875 | 5.5 |
| 30.5546875 | -2.7 |
| 30.5625 | -7.3 |
| 30.5703125 | -8.8 |
| 30.578125 | -5.6 |
| 30.5859375 | -3.5 |
| 30.59375 | -7 |
| 30.6015625 | -9.8 |
| 30.609375 | -10.8 |
| 30.6171875 | -12.6 |
| 30.625 | -17.6 |
| 30.6328125 | -28.7 |
| 30.640625 | -35.6 |
| 30.6484375 | -29.2 |
| 30.65625 | -21.8 |
| 30.6640625 | -19.5 |
| 30.671875 | -14.7 |
| 30.6796875 | -10.6 |
| 30.6875 | -9 |
| 30.6953125 | -4.1 |
| 30.703125 | -3.5 |
| 30.7109375 | -12.1 |
| 30.71875 | -16.3 |
| 30.7265625 | -10.9 |
| 30.734375 | -5.4 |
| 30.7421875 | -4.2 |
| 30.75 | -3.8 |
| 30.7578125 | 2.3 |
| 30.765625 | 11.8 |
| 30.7734375 | 14.2 |
| 30.78125 | 12.6 |
| 30.7890625 | 11.6 |
| 30.796875 | 4.5 |
| 30.8046875 | -5.6 |
| 30.8125 | -7.3 |
| 30.8203125 | -2.5 |
| 30.828125 | 2.2 |
| 30.8359375 | 5.8 |
| 30.84375 | 10.5 |
| 30.8515625 | 18.4 |
| 30.859375 | 27 |
| 30.8671875 | 31.7 |
| 30.875 | 32.1 |
| 30.8828125 | 29.3 |
| 30.890625 | 23.9 |
| 30.8984375 | 19.7 |
| 30.90625 | 19.2 |
| 30.9140625 | 17.3 |
| 30.921875 | 14 |
| 30.9296875 | 16.3 |
| 30.9375 | 22 |
| 30.9453125 | 22.8 |
| 30.953125 | 16.4 |
| 30.9609375 | 7.4 |
| 30.96875 | 3.1 |
| 30.9765625 | 3.1 |
| 30.984375 | -0.6 |
| 30.9921875 | -7.8 |
| 31.0 | -10.8 |
| 31.0078125 | -8.3 |
| 31.015625 | -5.4 |
| 31.0234375 | -6.8 |
| 31.03125 | -9 |
| 31.0390625 | -7.4 |
| 31.046875 | -7.7 |
| 31.0546875 | -16.6 |
| 31.0625 | -26.9 |
| 31.0703125 | -30.2 |
| 31.078125 | -27.9 |
| 31.0859375 | -22.7 |
| 31.09375 | -18.3 |
| 31.1015625 | -17.2 |
| 31.109375 | -9.7 |
| 31.1171875 | 4.3 |
| 31.125 | 8 |
| 31.1328125 | 3.3 |
| 31.140625 | 1.3 |
| 31.1484375 | -1.4 |
| 31.15625 | -2 |
| 31.1640625 | 3.4 |
| 31.171875 | 9.6 |
| 31.1796875 | 17.8 |
| 31.1875 | 26.9 |
| 31.1953125 | 32.3 |
| 31.203125 | 35.1 |
| 31.2109375 | 30.1 |
| 31.21875 | 16.7 |
| 31.2265625 | 5.4 |
| 31.234375 | -2.9 |
| 31.2421875 | -7.8 |
| 31.25 | -4.5 |
| 31.2578125 | 2.1 |
| 31.265625 | 4.7 |
| 31.2734375 | 2.7 |
| 31.28125 | 0.4 |
| 31.2890625 | -1.1 |
| 31.296875 | -9.4 |
| 31.3046875 | -20.4 |
| 31.3125 | -23.9 |
| 31.3203125 | -27.5 |
| 31.328125 | -34.2 |
| 31.3359375 | -33.2 |
| 31.34375 | -27.6 |
| 31.3515625 | -24.6 |
| 31.359375 | -20.7 |
| 31.3671875 | -17.7 |
| 31.375 | -15.8 |
| 31.3828125 | -9.9 |
| 31.390625 | -5.4 |
| 31.3984375 | -5.1 |
| 31.40625 | -1.1 |
| 31.4140625 | 4.4 |
| 31.421875 | 7.6 |
| 31.4296875 | 14.6 |
| 31.4375 | 21.6 |
| 31.4453125 | 21.7 |
| 31.453125 | 19.3 |
| 31.4609375 | 16.4 |
| 31.46875 | 12.3 |
| 31.4765625 | 8.5 |
| 31.484375 | 2.6 |
| 31.4921875 | -1.1 |
| 31.5 | 1.3 |
| 31.5078125 | 2.9 |
| 31.515625 | 3.3 |
| 31.5234375 | 4.3 |
| 31.53125 | 0.6 |
| 31.5390625 | -4.3 |
| 31.546875 | -4 |
| 31.5546875 | -3.6 |
| 31.5625 | -7.8 |
| 31.5703125 | -12.7 |
| 31.578125 | -11 |
| 31.5859375 | -4.5 |
| 31.59375 | -4.2 |
| 31.6015625 | -11.4 |
| 31.609375 | -16.4 |
| 31.6171875 | -13.2 |
| 31.625 | -4.7 |
| 31.6328125 | -0.6 |
| 31.640625 | -1.9 |
| 31.6484375 | 2.3 |
| 31.65625 | 10.9 |
| 31.6640625 | 10.8 |
| 31.671875 | 9.4 |
| 31.6796875 | 21.1 |
| 31.6875 | 34.8 |
| 31.6953125 | 38.9 |
| 31.703125 | 41.6 |
| 31.7109375 | 46.3 |
| 31.71875 | 46.9 |
| 31.7265625 | 42.2 |
| 31.734375 | 34.9 |
| 31.7421875 | 29.5 |
| 31.75 | 25.1 |
| 31.7578125 | 17.5 |
| 31.765625 | 11.7 |
| 31.7734375 | 10.5 |
| 31.78125 | 10.7 |
| 31.7890625 | 13.8 |
| 31.796875 | 16.4 |
| 31.8046875 | 14.2 |
| 31.8125 | 9.5 |
| 31.8203125 | 2.1 |
| 31.828125 | -4.1 |
| 31.8359375 | -4.4 |
| 31.84375 | -8.8 |
| 31.8515625 | -19 |
| 31.859375 | -20.7 |
| 31.8671875 | -13.3 |
| 31.875 | -8 |
| 31.8828125 | -8.8 |
| 31.890625 | -12.6 |
| 31.8984375 | -12 |
| 31.90625 | -3.8 |
| 31.9140625 | 3.3 |
| 31.921875 | 3.8 |
| 31.9296875 | 3 |
| 31.9375 | 3.8 |
| 31.9453125 | 5 |
| 31.953125 | 6.2 |
| 31.9609375 | 7.6 |
| 31.96875 | 7.3 |
| 31.9765625 | 4.3 |
| 31.984375 | 1.9 |
| 31.9921875 | -0.9 |